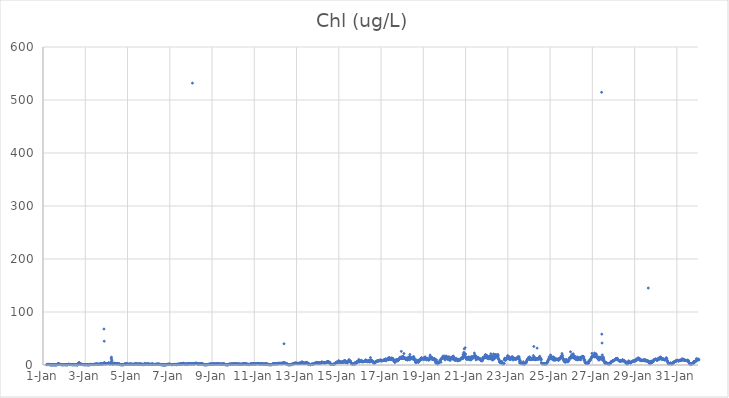
| Category | Chl (ug/L) |
|---|---|
| 44562.166666666664 | 0.7 |
| 44562.177083333336 | 0.87 |
| 44562.1875 | 0.81 |
| 44562.197916666664 | 0.81 |
| 44562.208333333336 | 0.92 |
| 44562.21875 | 0.9 |
| 44562.229166666664 | 1.01 |
| 44562.239583333336 | 1.39 |
| 44562.25 | 1 |
| 44562.260416666664 | 0.93 |
| 44562.270833333336 | 0.94 |
| 44562.28125 | 0.81 |
| 44562.291666666664 | 0.79 |
| 44562.302083333336 | 0.75 |
| 44562.3125 | 0.6 |
| 44562.322916666664 | 0.63 |
| 44562.333333333336 | 0.68 |
| 44562.34375 | 0.9 |
| 44562.354166666664 | 0.45 |
| 44562.364583333336 | 0.42 |
| 44562.375 | 0.45 |
| 44562.385416666664 | 0.47 |
| 44562.395833333336 | 0.44 |
| 44562.40625 | 0.43 |
| 44562.416666666664 | 0.4 |
| 44562.427083333336 | 0.54 |
| 44562.4375 | 0.45 |
| 44562.447916666664 | 0.45 |
| 44562.458333333336 | 0.47 |
| 44562.46875 | 0.33 |
| 44562.479166666664 | 0.47 |
| 44562.489583333336 | 0.49 |
| 44562.5 | 0.47 |
| 44562.510416666664 | 0.61 |
| 44562.520833333336 | 0.6 |
| 44562.53125 | 0.54 |
| 44562.541666666664 | 0.44 |
| 44562.552083333336 | 0.39 |
| 44562.5625 | 0.28 |
| 44562.572916666664 | 0.37 |
| 44562.583333333336 | 0.36 |
| 44562.59375 | 0.3 |
| 44562.604166666664 | 0.45 |
| 44562.614583333336 | 0.37 |
| 44562.625 | 0.44 |
| 44562.635416666664 | 0.46 |
| 44562.645833333336 | 0.42 |
| 44562.65625 | 0.52 |
| 44562.666666666664 | 0.74 |
| 44562.677083333336 | 0.89 |
| 44562.6875 | 1.62 |
| 44562.697916666664 | 1.38 |
| 44562.708333333336 | 2.7 |
| 44562.71875 | 2.04 |
| 44562.729166666664 | 1.4 |
| 44562.739583333336 | 1.65 |
| 44562.75 | 1.95 |
| 44562.760416666664 | 1.29 |
| 44562.770833333336 | 1.16 |
| 44562.78125 | 1.77 |
| 44562.791666666664 | 1.46 |
| 44562.802083333336 | 1.2 |
| 44562.8125 | 0.99 |
| 44562.822916666664 | 0.96 |
| 44562.833333333336 | 0.88 |
| 44562.84375 | 0.95 |
| 44562.854166666664 | 0.77 |
| 44562.864583333336 | 0.7 |
| 44562.875 | 0.73 |
| 44562.885416666664 | 0.69 |
| 44562.895833333336 | 0.67 |
| 44562.90625 | 0.59 |
| 44562.916666666664 | 0.61 |
| 44562.927083333336 | 0.42 |
| 44562.9375 | 0.45 |
| 44562.947916666664 | 0.65 |
| 44562.958333333336 | 0.63 |
| 44562.96875 | 0.7 |
| 44562.979166666664 | 0.64 |
| 44562.989583333336 | 0.6 |
| 44563.0 | 0.71 |
| 44563.010416666664 | 0.66 |
| 44563.020833333336 | 0.74 |
| 44563.03125 | 0.86 |
| 44563.041666666664 | 0.61 |
| 44563.052083333336 | 0.52 |
| 44563.0625 | 0.63 |
| 44563.072916666664 | 0.62 |
| 44563.083333333336 | 0.54 |
| 44563.09375 | 0.6 |
| 44563.104166666664 | 0.51 |
| 44563.114583333336 | 0.6 |
| 44563.125 | 0.47 |
| 44563.135416666664 | 0.46 |
| 44563.145833333336 | 0.51 |
| 44563.15625 | 0.57 |
| 44563.166666666664 | 0.61 |
| 44563.177083333336 | 0.76 |
| 44563.1875 | 0.81 |
| 44563.197916666664 | 0.91 |
| 44563.208333333336 | 1.67 |
| 44563.21875 | 1.21 |
| 44563.229166666664 | 1.25 |
| 44563.239583333336 | 1.08 |
| 44563.25 | 0.99 |
| 44563.260416666664 | 0.96 |
| 44563.270833333336 | 0.87 |
| 44563.28125 | 1.01 |
| 44563.291666666664 | 0.85 |
| 44563.302083333336 | 0.84 |
| 44563.3125 | 0.88 |
| 44563.322916666664 | 0.85 |
| 44563.333333333336 | 0.77 |
| 44563.34375 | 0.86 |
| 44563.354166666664 | 0.83 |
| 44563.364583333336 | 0.62 |
| 44563.375 | 0.76 |
| 44563.385416666664 | 0.64 |
| 44563.395833333336 | 0.69 |
| 44563.40625 | 0.62 |
| 44563.416666666664 | 0.48 |
| 44563.427083333336 | 0.53 |
| 44563.4375 | 0.54 |
| 44563.447916666664 | 0.68 |
| 44563.458333333336 | 0.6 |
| 44563.46875 | 0.61 |
| 44563.479166666664 | 0.6 |
| 44563.489583333336 | 0.54 |
| 44563.5 | 0.68 |
| 44563.510416666664 | 0.56 |
| 44563.520833333336 | 0.67 |
| 44563.53125 | 0.65 |
| 44563.541666666664 | 0.57 |
| 44563.552083333336 | 0.58 |
| 44563.5625 | 0.67 |
| 44563.572916666664 | 0.66 |
| 44563.583333333336 | 0.51 |
| 44563.59375 | 0.51 |
| 44563.604166666664 | 0.51 |
| 44563.614583333336 | 0.65 |
| 44563.625 | 0.37 |
| 44563.635416666664 | 0.31 |
| 44563.645833333336 | 0.37 |
| 44563.65625 | 2.34 |
| 44563.666666666664 | 2.14 |
| 44563.677083333336 | 3.11 |
| 44563.6875 | 2.67 |
| 44563.697916666664 | 3.8 |
| 44563.708333333336 | 3.76 |
| 44563.71875 | 4.67 |
| 44563.729166666664 | 3.15 |
| 44563.739583333336 | 2.54 |
| 44563.75 | 1.52 |
| 44563.760416666664 | 1.08 |
| 44563.770833333336 | 1.08 |
| 44563.78125 | 1.09 |
| 44563.791666666664 | 1.12 |
| 44563.802083333336 | 1.13 |
| 44563.8125 | 1.22 |
| 44563.822916666664 | 1.57 |
| 44563.833333333336 | 1.27 |
| 44563.84375 | 1.12 |
| 44563.854166666664 | 0.95 |
| 44563.864583333336 | 0.85 |
| 44563.875 | 0.91 |
| 44563.885416666664 | 0.79 |
| 44563.895833333336 | 0.82 |
| 44563.90625 | 0.74 |
| 44563.916666666664 | 0.78 |
| 44563.927083333336 | 0.65 |
| 44563.9375 | 0.67 |
| 44563.947916666664 | 0.61 |
| 44563.958333333336 | 0.61 |
| 44563.96875 | 0.56 |
| 44563.979166666664 | 0.51 |
| 44563.989583333336 | 0.45 |
| 44564.0 | 0.46 |
| 44564.010416666664 | 0.62 |
| 44564.020833333336 | 0.64 |
| 44564.03125 | 0.57 |
| 44564.041666666664 | 0.64 |
| 44564.052083333336 | 0.82 |
| 44564.0625 | 0.87 |
| 44564.072916666664 | 0.5 |
| 44564.083333333336 | 0.71 |
| 44564.09375 | 0.53 |
| 44564.104166666664 | 0.55 |
| 44564.114583333336 | 0.56 |
| 44564.125 | 0.5 |
| 44564.135416666664 | 0.48 |
| 44564.145833333336 | 0.45 |
| 44564.15625 | 0.47 |
| 44564.166666666664 | 0.45 |
| 44564.177083333336 | 0.56 |
| 44564.1875 | 0.64 |
| 44564.197916666664 | 0.65 |
| 44564.208333333336 | 0.56 |
| 44564.21875 | 0.6 |
| 44564.229166666664 | 0.71 |
| 44564.239583333336 | 0.85 |
| 44564.25 | 1.19 |
| 44564.260416666664 | 1 |
| 44564.270833333336 | 1.05 |
| 44564.28125 | 1.03 |
| 44564.291666666664 | 1 |
| 44564.302083333336 | 0.96 |
| 44564.3125 | 1.01 |
| 44564.322916666664 | 1.03 |
| 44564.333333333336 | 0.97 |
| 44564.34375 | 0.89 |
| 44564.354166666664 | 1.07 |
| 44564.364583333336 | 0.96 |
| 44564.375 | 0.75 |
| 44564.385416666664 | 0.88 |
| 44564.395833333336 | 0.85 |
| 44564.40625 | 1.03 |
| 44564.416666666664 | 1.12 |
| 44564.427083333336 | 1.32 |
| 44564.4375 | 1.21 |
| 44564.447916666664 | 1.36 |
| 44564.458333333336 | 1.46 |
| 44564.46875 | 1.45 |
| 44564.479166666664 | 1.41 |
| 44564.489583333336 | 1.6 |
| 44564.5 | 1.44 |
| 44564.510416666664 | 1.46 |
| 44564.520833333336 | 1.5 |
| 44564.53125 | 1.79 |
| 44564.541666666664 | 1.87 |
| 44564.552083333336 | 1.82 |
| 44564.5625 | 1.7 |
| 44564.572916666664 | 1.58 |
| 44564.583333333336 | 1.58 |
| 44564.59375 | 1.58 |
| 44564.604166666664 | 1.35 |
| 44564.614583333336 | 1.26 |
| 44564.625 | 1.24 |
| 44564.635416666664 | 1.33 |
| 44564.645833333336 | 1.28 |
| 44564.65625 | 1.35 |
| 44564.666666666664 | 1.25 |
| 44564.677083333336 | 1.23 |
| 44564.6875 | 1.42 |
| 44564.697916666664 | 1.69 |
| 44564.708333333336 | 1.8 |
| 44564.71875 | 2.59 |
| 44564.729166666664 | 2.02 |
| 44564.739583333336 | 2.81 |
| 44564.75 | 1.94 |
| 44564.760416666664 | 1.98 |
| 44564.770833333336 | 2.06 |
| 44564.78125 | 1.95 |
| 44564.791666666664 | 1.95 |
| 44564.802083333336 | 1.74 |
| 44564.8125 | 2.14 |
| 44564.822916666664 | 1.97 |
| 44564.833333333336 | 2.16 |
| 44564.84375 | 2.32 |
| 44564.854166666664 | 2.19 |
| 44564.864583333336 | 2.26 |
| 44564.875 | 2.55 |
| 44564.885416666664 | 67.88 |
| 44564.895833333336 | 44.92 |
| 44564.90625 | 4.78 |
| 44564.916666666664 | 2.61 |
| 44564.927083333336 | 2.14 |
| 44564.9375 | 2.31 |
| 44564.947916666664 | 2.33 |
| 44564.958333333336 | 2.29 |
| 44564.96875 | 2.76 |
| 44564.979166666664 | 2.57 |
| 44564.989583333336 | 2.32 |
| 44565.0 | 2.49 |
| 44565.010416666664 | 2.39 |
| 44565.020833333336 | 2.58 |
| 44565.03125 | 2.44 |
| 44565.041666666664 | 2.48 |
| 44565.052083333336 | 2.57 |
| 44565.0625 | 2.75 |
| 44565.072916666664 | 2.61 |
| 44565.083333333336 | 2.77 |
| 44565.09375 | 3.09 |
| 44565.104166666664 | 3.41 |
| 44565.114583333336 | 4.19 |
| 44565.125 | 3.48 |
| 44565.135416666664 | 2.44 |
| 44565.145833333336 | 2.37 |
| 44565.15625 | 2.21 |
| 44565.166666666664 | 2.52 |
| 44565.177083333336 | 2.38 |
| 44565.1875 | 2.32 |
| 44565.197916666664 | 1.87 |
| 44565.208333333336 | 1.82 |
| 44565.21875 | 5.43 |
| 44565.229166666664 | 12.92 |
| 44565.239583333336 | 14.78 |
| 44565.25 | 10.24 |
| 44565.260416666664 | 7.89 |
| 44565.270833333336 | 2 |
| 44565.28125 | 1.95 |
| 44565.291666666664 | 1.84 |
| 44565.302083333336 | 1.88 |
| 44565.3125 | 2.09 |
| 44565.322916666664 | 2.2 |
| 44565.333333333336 | 2.31 |
| 44565.34375 | 2.15 |
| 44565.354166666664 | 2.36 |
| 44565.364583333336 | 3.84 |
| 44565.375 | 2.36 |
| 44565.385416666664 | 2.51 |
| 44565.395833333336 | 2.37 |
| 44565.40625 | 2.92 |
| 44565.416666666664 | 2.67 |
| 44565.427083333336 | 2.57 |
| 44565.4375 | 2.37 |
| 44565.447916666664 | 2.26 |
| 44565.458333333336 | 2.38 |
| 44565.46875 | 2.12 |
| 44565.479166666664 | 2.09 |
| 44565.489583333336 | 2.1 |
| 44565.5 | 2.07 |
| 44565.510416666664 | 2.2 |
| 44565.520833333336 | 2.23 |
| 44565.53125 | 2.68 |
| 44565.541666666664 | 2.61 |
| 44565.552083333336 | 2.34 |
| 44565.5625 | 2.42 |
| 44565.572916666664 | 2.3 |
| 44565.583333333336 | 2 |
| 44565.59375 | 2.2 |
| 44565.604166666664 | 1.94 |
| 44565.614583333336 | 1.65 |
| 44565.625 | 1.37 |
| 44565.635416666664 | 1.29 |
| 44565.645833333336 | 1.24 |
| 44565.65625 | 0.6 |
| 44565.666666666664 | 0.67 |
| 44565.677083333336 | 0.81 |
| 44565.6875 | 0.8 |
| 44565.697916666664 | 0.89 |
| 44565.708333333336 | 0.62 |
| 44565.71875 | 0.66 |
| 44565.729166666664 | 0.46 |
| 44565.739583333336 | 0.5 |
| 44565.75 | 0.57 |
| 44565.760416666664 | 0.45 |
| 44565.770833333336 | 0.6 |
| 44565.78125 | 0.59 |
| 44565.791666666664 | 0.4 |
| 44565.802083333336 | 0.48 |
| 44565.8125 | 0.71 |
| 44565.822916666664 | 0.74 |
| 44565.833333333336 | 1.09 |
| 44565.84375 | 1.46 |
| 44565.854166666664 | 1.68 |
| 44565.864583333336 | 1.65 |
| 44565.875 | 1.93 |
| 44565.885416666664 | 2.02 |
| 44565.895833333336 | 1.85 |
| 44565.90625 | 1.96 |
| 44565.916666666664 | 1.81 |
| 44565.927083333336 | 1.98 |
| 44565.9375 | 2.05 |
| 44565.947916666664 | 2.19 |
| 44565.958333333336 | 1.89 |
| 44565.96875 | 1.82 |
| 44565.979166666664 | 1.84 |
| 44565.989583333336 | 1.74 |
| 44566.0 | 1.63 |
| 44566.010416666664 | 1.41 |
| 44566.020833333336 | 1.33 |
| 44566.03125 | 1.39 |
| 44566.041666666664 | 1.29 |
| 44566.052083333336 | 1.25 |
| 44566.0625 | 1.44 |
| 44566.072916666664 | 1.3 |
| 44566.083333333336 | 1.41 |
| 44566.09375 | 1.43 |
| 44566.104166666664 | 1.6 |
| 44566.114583333336 | 1.61 |
| 44566.125 | 1.65 |
| 44566.135416666664 | 1.71 |
| 44566.145833333336 | 1.81 |
| 44566.15625 | 1.94 |
| 44566.166666666664 | 1.53 |
| 44566.177083333336 | 1.4 |
| 44566.1875 | 1.24 |
| 44566.197916666664 | 1.23 |
| 44566.208333333336 | 1.26 |
| 44566.21875 | 1.54 |
| 44566.229166666664 | 1.29 |
| 44566.239583333336 | 1.16 |
| 44566.25 | 1.19 |
| 44566.260416666664 | 1.08 |
| 44566.270833333336 | 1.09 |
| 44566.28125 | 1.17 |
| 44566.291666666664 | 1.29 |
| 44566.302083333336 | 1.52 |
| 44566.3125 | 1.56 |
| 44566.322916666664 | 1.42 |
| 44566.333333333336 | 1.71 |
| 44566.34375 | 1.63 |
| 44566.354166666664 | 1.65 |
| 44566.364583333336 | 1.7 |
| 44566.375 | 1.82 |
| 44566.385416666664 | 2.26 |
| 44566.395833333336 | 1.82 |
| 44566.40625 | 2.06 |
| 44566.416666666664 | 2.18 |
| 44566.427083333336 | 1.7 |
| 44566.4375 | 1.73 |
| 44566.447916666664 | 1.67 |
| 44566.458333333336 | 1.82 |
| 44566.46875 | 1.76 |
| 44566.479166666664 | 1.67 |
| 44566.489583333336 | 1.53 |
| 44566.5 | 1.37 |
| 44566.510416666664 | 1.51 |
| 44566.520833333336 | 1.33 |
| 44566.53125 | 1.53 |
| 44566.541666666664 | 1.46 |
| 44566.552083333336 | 1.68 |
| 44566.5625 | 1.81 |
| 44566.572916666664 | 1.67 |
| 44566.583333333336 | 1.67 |
| 44566.59375 | 1.96 |
| 44566.604166666664 | 1.98 |
| 44566.614583333336 | 1.85 |
| 44566.625 | 1.54 |
| 44566.635416666664 | 1.36 |
| 44566.645833333336 | 1.24 |
| 44566.65625 | 1.19 |
| 44566.666666666664 | 1.57 |
| 44566.677083333336 | 1.67 |
| 44566.6875 | 1.59 |
| 44566.697916666664 | 1.4 |
| 44566.708333333336 | 1.12 |
| 44566.71875 | 0.51 |
| 44566.729166666664 | 1.27 |
| 44566.739583333336 | 1.25 |
| 44566.75 | 0.97 |
| 44566.760416666664 | 0.98 |
| 44566.770833333336 | 0.54 |
| 44566.78125 | 0.96 |
| 44566.791666666664 | 0.89 |
| 44566.802083333336 | 0.95 |
| 44566.8125 | 3.14 |
| 44566.822916666664 | 1.35 |
| 44566.833333333336 | 1.18 |
| 44566.84375 | 1.45 |
| 44566.854166666664 | 1.49 |
| 44566.864583333336 | 1.72 |
| 44566.875 | 1.47 |
| 44566.885416666664 | 1.75 |
| 44566.895833333336 | 1.55 |
| 44566.90625 | 1.58 |
| 44566.916666666664 | 1.42 |
| 44566.927083333336 | 2.04 |
| 44566.9375 | 1.87 |
| 44566.947916666664 | 1.87 |
| 44566.958333333336 | 1.76 |
| 44566.96875 | 1.95 |
| 44566.979166666664 | 1.55 |
| 44566.989583333336 | 1.67 |
| 44567.0 | 1.76 |
| 44567.010416666664 | 1.47 |
| 44567.020833333336 | 1.48 |
| 44567.03125 | 1.64 |
| 44567.041666666664 | 1.36 |
| 44567.052083333336 | 1.21 |
| 44567.0625 | 1.12 |
| 44567.072916666664 | 1.11 |
| 44567.083333333336 | 1.17 |
| 44567.09375 | 1.11 |
| 44567.104166666664 | 1.19 |
| 44567.114583333336 | 1.37 |
| 44567.125 | 1.33 |
| 44567.135416666664 | 1.18 |
| 44567.145833333336 | 1.37 |
| 44567.15625 | 1.41 |
| 44567.166666666664 | 2.55 |
| 44567.177083333336 | 1.71 |
| 44567.1875 | 1.58 |
| 44567.197916666664 | 1.69 |
| 44567.208333333336 | 1.19 |
| 44567.21875 | 1.13 |
| 44567.229166666664 | 1.01 |
| 44567.239583333336 | 1.12 |
| 44567.25 | 1.15 |
| 44567.260416666664 | 1.06 |
| 44567.270833333336 | 1.05 |
| 44567.28125 | 1.04 |
| 44567.291666666664 | 1.05 |
| 44567.302083333336 | 1.07 |
| 44567.3125 | 0.99 |
| 44567.322916666664 | 1.04 |
| 44567.333333333336 | 1.11 |
| 44567.34375 | 1.36 |
| 44567.354166666664 | 1.47 |
| 44567.364583333336 | 1.21 |
| 44567.375 | 1.46 |
| 44567.385416666664 | 1.34 |
| 44567.395833333336 | 1.43 |
| 44567.40625 | 1.48 |
| 44567.416666666664 | 1.47 |
| 44567.427083333336 | 1.66 |
| 44567.4375 | 1.62 |
| 44567.447916666664 | 1.49 |
| 44567.458333333336 | 1.62 |
| 44567.46875 | 1.49 |
| 44567.479166666664 | 1.43 |
| 44567.489583333336 | 1.38 |
| 44567.5 | 1.5 |
| 44567.510416666664 | 1.4 |
| 44567.520833333336 | 1.2 |
| 44567.53125 | 1.26 |
| 44567.541666666664 | 1.19 |
| 44567.552083333336 | 0.89 |
| 44567.5625 | 0.72 |
| 44567.572916666664 | 0.81 |
| 44567.583333333336 | 0.75 |
| 44567.59375 | 0.83 |
| 44567.604166666664 | 0.7 |
| 44567.614583333336 | 0.6 |
| 44567.625 | 0.84 |
| 44567.635416666664 | 1.01 |
| 44567.645833333336 | 0.83 |
| 44567.65625 | 0.29 |
| 44567.666666666664 | 0.24 |
| 44567.677083333336 | 0.31 |
| 44567.6875 | 0.23 |
| 44567.697916666664 | 0.4 |
| 44567.708333333336 | 0.32 |
| 44567.71875 | 0.23 |
| 44567.729166666664 | 0.34 |
| 44567.739583333336 | 0.33 |
| 44567.75 | 0.35 |
| 44567.760416666664 | 0.37 |
| 44567.770833333336 | 0.55 |
| 44567.78125 | 0.4 |
| 44567.791666666664 | 0.48 |
| 44567.802083333336 | 0.35 |
| 44567.8125 | 0.28 |
| 44567.822916666664 | 0.57 |
| 44567.833333333336 | 0.47 |
| 44567.84375 | 0.66 |
| 44567.854166666664 | 0.66 |
| 44567.864583333336 | 0.93 |
| 44567.875 | 1.16 |
| 44567.885416666664 | 1.22 |
| 44567.895833333336 | 1.09 |
| 44567.90625 | 1.2 |
| 44567.916666666664 | 1.16 |
| 44567.927083333336 | 1.15 |
| 44567.9375 | 1.3 |
| 44567.947916666664 | 1.54 |
| 44567.958333333336 | 1.38 |
| 44567.96875 | 1.48 |
| 44567.979166666664 | 1.43 |
| 44567.989583333336 | 1.34 |
| 44568.0 | 1.26 |
| 44568.010416666664 | 1.28 |
| 44568.020833333336 | 1.26 |
| 44568.03125 | 1.16 |
| 44568.041666666664 | 1 |
| 44568.052083333336 | 0.94 |
| 44568.0625 | 0.88 |
| 44568.072916666664 | 0.93 |
| 44568.083333333336 | 0.74 |
| 44568.09375 | 0.69 |
| 44568.104166666664 | 0.65 |
| 44568.114583333336 | 0.59 |
| 44568.125 | 0.71 |
| 44568.135416666664 | 0.8 |
| 44568.145833333336 | 0.84 |
| 44568.15625 | 0.92 |
| 44568.166666666664 | 0.93 |
| 44568.177083333336 | 0.96 |
| 44568.1875 | 1.03 |
| 44568.197916666664 | 1.02 |
| 44568.208333333336 | 1.1 |
| 44568.21875 | 0.97 |
| 44568.229166666664 | 1.02 |
| 44568.239583333336 | 1.05 |
| 44568.25 | 1.09 |
| 44568.260416666664 | 1.06 |
| 44568.270833333336 | 0.87 |
| 44568.28125 | 0.89 |
| 44568.291666666664 | 0.78 |
| 44568.302083333336 | 0.74 |
| 44568.3125 | 0.71 |
| 44568.322916666664 | 0.68 |
| 44568.333333333336 | 0.66 |
| 44568.34375 | 1.51 |
| 44568.354166666664 | 0.99 |
| 44568.364583333336 | 1.38 |
| 44568.375 | 1.46 |
| 44568.385416666664 | 0.91 |
| 44568.395833333336 | 1.06 |
| 44568.40625 | 1.2 |
| 44568.416666666664 | 1.32 |
| 44568.427083333336 | 1.38 |
| 44568.4375 | 1.57 |
| 44568.447916666664 | 1.49 |
| 44568.458333333336 | 1.58 |
| 44568.46875 | 1.53 |
| 44568.479166666664 | 1.75 |
| 44568.489583333336 | 1.93 |
| 44568.5 | 1.98 |
| 44568.510416666664 | 2.24 |
| 44568.520833333336 | 1.78 |
| 44568.53125 | 1.48 |
| 44568.541666666664 | 1.77 |
| 44568.552083333336 | 1.67 |
| 44568.5625 | 1.61 |
| 44568.572916666664 | 2.57 |
| 44568.583333333336 | 2.75 |
| 44568.59375 | 2.03 |
| 44568.604166666664 | 1.78 |
| 44568.614583333336 | 2.15 |
| 44568.625 | 2.11 |
| 44568.635416666664 | 2.93 |
| 44568.645833333336 | 2.41 |
| 44568.65625 | 3.17 |
| 44568.666666666664 | 3.24 |
| 44568.677083333336 | 2.98 |
| 44568.6875 | 2.19 |
| 44568.697916666664 | 1.45 |
| 44568.708333333336 | 2.04 |
| 44568.71875 | 1.53 |
| 44568.729166666664 | 1.34 |
| 44568.739583333336 | 1.57 |
| 44568.75 | 1.04 |
| 44568.760416666664 | 1.21 |
| 44568.770833333336 | 1.24 |
| 44568.78125 | 1.28 |
| 44568.791666666664 | 1.36 |
| 44568.802083333336 | 3 |
| 44568.8125 | 1.03 |
| 44568.822916666664 | 1.32 |
| 44568.833333333336 | 1.32 |
| 44568.84375 | 1.6 |
| 44568.854166666664 | 2.14 |
| 44568.864583333336 | 1.86 |
| 44568.875 | 1.9 |
| 44568.885416666664 | 2.22 |
| 44568.895833333336 | 2.14 |
| 44568.90625 | 2.1 |
| 44568.916666666664 | 2.33 |
| 44568.927083333336 | 2.04 |
| 44568.9375 | 1.97 |
| 44568.947916666664 | 2.1 |
| 44568.958333333336 | 2.12 |
| 44568.96875 | 2.88 |
| 44568.979166666664 | 2.75 |
| 44568.989583333336 | 2.26 |
| 44569.0 | 1.95 |
| 44569.010416666664 | 1.83 |
| 44569.020833333336 | 1.94 |
| 44569.03125 | 2.37 |
| 44569.041666666664 | 2.12 |
| 44569.052083333336 | 2.15 |
| 44569.0625 | 2.13 |
| 44569.072916666664 | 531.84 |
| 44569.083333333336 | 2.23 |
| 44569.09375 | 2.44 |
| 44569.104166666664 | 2.72 |
| 44569.114583333336 | 2.42 |
| 44569.125 | 1.99 |
| 44569.135416666664 | 2.08 |
| 44569.145833333336 | 1.87 |
| 44569.15625 | 2 |
| 44569.166666666664 | 1.93 |
| 44569.177083333336 | 2.23 |
| 44569.1875 | 2.62 |
| 44569.197916666664 | 2.58 |
| 44569.208333333336 | 2.69 |
| 44569.21875 | 2.76 |
| 44569.229166666664 | 3.39 |
| 44569.239583333336 | 3.42 |
| 44569.25 | 3.54 |
| 44569.260416666664 | 2.96 |
| 44569.270833333336 | 2.95 |
| 44569.28125 | 2.56 |
| 44569.291666666664 | 2.57 |
| 44569.302083333336 | 2.18 |
| 44569.3125 | 2.23 |
| 44569.322916666664 | 2.32 |
| 44569.333333333336 | 1.91 |
| 44569.34375 | 1.81 |
| 44569.354166666664 | 1.83 |
| 44569.364583333336 | 1.71 |
| 44569.375 | 1.65 |
| 44569.385416666664 | 1.77 |
| 44569.395833333336 | 1.88 |
| 44569.40625 | 2.02 |
| 44569.416666666664 | 2.09 |
| 44569.427083333336 | 2 |
| 44569.4375 | 1.85 |
| 44569.447916666664 | 1.95 |
| 44569.458333333336 | 2 |
| 44569.46875 | 1.9 |
| 44569.479166666664 | 1.93 |
| 44569.489583333336 | 2.2 |
| 44569.5 | 2.65 |
| 44569.510416666664 | 2.3 |
| 44569.520833333336 | 2.34 |
| 44569.53125 | 2.19 |
| 44569.541666666664 | 2.1 |
| 44569.552083333336 | 2.07 |
| 44569.5625 | 1.8 |
| 44569.572916666664 | 1.41 |
| 44569.583333333336 | 1.14 |
| 44569.59375 | 1.31 |
| 44569.604166666664 | 1.06 |
| 44569.614583333336 | 0.81 |
| 44569.625 | 0.66 |
| 44569.635416666664 | 0.6 |
| 44569.645833333336 | 0.51 |
| 44569.65625 | 0.58 |
| 44569.666666666664 | 0.33 |
| 44569.677083333336 | 0.6 |
| 44569.6875 | 0.55 |
| 44569.697916666664 | 0.42 |
| 44569.708333333336 | 0.44 |
| 44569.71875 | 0.64 |
| 44569.729166666664 | 0.5 |
| 44569.739583333336 | 0.61 |
| 44569.75 | 0.73 |
| 44569.760416666664 | 0.69 |
| 44569.770833333336 | 1.13 |
| 44569.78125 | 0.94 |
| 44569.791666666664 | 0.54 |
| 44569.802083333336 | 0.58 |
| 44569.8125 | 1.15 |
| 44569.822916666664 | 1.09 |
| 44569.833333333336 | 1.2 |
| 44569.84375 | 1.04 |
| 44569.854166666664 | 0.75 |
| 44569.864583333336 | 0.81 |
| 44569.875 | 1.38 |
| 44569.885416666664 | 1.54 |
| 44569.895833333336 | 1.74 |
| 44569.90625 | 1.64 |
| 44569.916666666664 | 1.61 |
| 44569.927083333336 | 1.63 |
| 44569.9375 | 1.62 |
| 44569.947916666664 | 1.66 |
| 44569.958333333336 | 1.6 |
| 44569.96875 | 1.64 |
| 44569.979166666664 | 1.6 |
| 44569.989583333336 | 1.75 |
| 44570.0 | 1.68 |
| 44570.010416666664 | 1.63 |
| 44570.020833333336 | 1.79 |
| 44570.03125 | 2.53 |
| 44570.041666666664 | 1.79 |
| 44570.052083333336 | 1.92 |
| 44570.0625 | 1.75 |
| 44570.072916666664 | 1.85 |
| 44570.083333333336 | 1.83 |
| 44570.09375 | 1.95 |
| 44570.104166666664 | 1.83 |
| 44570.114583333336 | 1.91 |
| 44570.125 | 2.01 |
| 44570.135416666664 | 1.85 |
| 44570.145833333336 | 1.88 |
| 44570.15625 | 1.74 |
| 44570.166666666664 | 1.63 |
| 44570.177083333336 | 1.84 |
| 44570.1875 | 1.68 |
| 44570.197916666664 | 1.67 |
| 44570.208333333336 | 1.69 |
| 44570.21875 | 1.91 |
| 44570.229166666664 | 2.15 |
| 44570.239583333336 | 2.1 |
| 44570.25 | 2.47 |
| 44570.260416666664 | 2.39 |
| 44570.270833333336 | 2.35 |
| 44570.28125 | 2.07 |
| 44570.291666666664 | 2.23 |
| 44570.302083333336 | 2.25 |
| 44570.3125 | 1.9 |
| 44570.322916666664 | 1.77 |
| 44570.333333333336 | 1.71 |
| 44570.34375 | 1.74 |
| 44570.354166666664 | 1.77 |
| 44570.364583333336 | 1.65 |
| 44570.375 | 1.48 |
| 44570.385416666664 | 1.64 |
| 44570.395833333336 | 1.62 |
| 44570.40625 | 1.55 |
| 44570.416666666664 | 1.62 |
| 44570.427083333336 | 1.54 |
| 44570.4375 | 1.54 |
| 44570.447916666664 | 1.54 |
| 44570.458333333336 | 1.47 |
| 44570.46875 | 1.47 |
| 44570.479166666664 | 1.62 |
| 44570.489583333336 | 1.49 |
| 44570.5 | 1.59 |
| 44570.510416666664 | 1.7 |
| 44570.520833333336 | 2.17 |
| 44570.53125 | 2.02 |
| 44570.541666666664 | 1.85 |
| 44570.552083333336 | 1.92 |
| 44570.5625 | 1.83 |
| 44570.572916666664 | 2.24 |
| 44570.583333333336 | 1.57 |
| 44570.59375 | 1.07 |
| 44570.604166666664 | 0.95 |
| 44570.614583333336 | 0.64 |
| 44570.625 | 0.64 |
| 44570.635416666664 | 0.68 |
| 44570.645833333336 | 0.67 |
| 44570.65625 | 0.42 |
| 44570.666666666664 | 0.57 |
| 44570.677083333336 | 0.62 |
| 44570.6875 | 0.78 |
| 44570.697916666664 | 0.49 |
| 44570.708333333336 | 0.51 |
| 44570.71875 | 0.4 |
| 44570.729166666664 | 0.38 |
| 44570.739583333336 | 0.55 |
| 44570.75 | 0.42 |
| 44570.760416666664 | 0.46 |
| 44570.770833333336 | 0.4 |
| 44570.78125 | 1.02 |
| 44570.791666666664 | 1.25 |
| 44570.802083333336 | 1.46 |
| 44570.8125 | 1.32 |
| 44570.822916666664 | 1.44 |
| 44570.833333333336 | 1.34 |
| 44570.84375 | 1.44 |
| 44570.854166666664 | 1.45 |
| 44570.864583333336 | 1.66 |
| 44570.875 | 1.54 |
| 44570.885416666664 | 1.53 |
| 44570.895833333336 | 1.56 |
| 44570.90625 | 1.6 |
| 44570.916666666664 | 1.68 |
| 44570.927083333336 | 1.75 |
| 44570.9375 | 1.82 |
| 44570.947916666664 | 1.77 |
| 44570.958333333336 | 1.77 |
| 44570.96875 | 1.77 |
| 44570.979166666664 | 1.69 |
| 44570.989583333336 | 1.68 |
| 44571.0 | 1.8 |
| 44571.010416666664 | 1.83 |
| 44571.020833333336 | 1.76 |
| 44571.03125 | 1.92 |
| 44571.041666666664 | 2.09 |
| 44571.052083333336 | 1.88 |
| 44571.0625 | 1.95 |
| 44571.072916666664 | 1.9 |
| 44571.083333333336 | 2.11 |
| 44571.09375 | 1.96 |
| 44571.104166666664 | 2.06 |
| 44571.114583333336 | 2.16 |
| 44571.125 | 2.25 |
| 44571.135416666664 | 1.94 |
| 44571.145833333336 | 2.02 |
| 44571.15625 | 2.19 |
| 44571.166666666664 | 2.04 |
| 44571.177083333336 | 2.11 |
| 44571.1875 | 1.89 |
| 44571.197916666664 | 1.82 |
| 44571.208333333336 | 1.61 |
| 44571.21875 | 1.49 |
| 44571.229166666664 | 1.5 |
| 44571.239583333336 | 1.29 |
| 44571.25 | 1.86 |
| 44571.260416666664 | 1.37 |
| 44571.270833333336 | 1.57 |
| 44571.28125 | 1.68 |
| 44571.291666666664 | 1.58 |
| 44571.302083333336 | 1.93 |
| 44571.3125 | 1.56 |
| 44571.322916666664 | 1.47 |
| 44571.333333333336 | 1.32 |
| 44571.34375 | 1.33 |
| 44571.354166666664 | 1.37 |
| 44571.364583333336 | 1.33 |
| 44571.375 | 1.51 |
| 44571.385416666664 | 1.17 |
| 44571.395833333336 | 1.36 |
| 44571.40625 | 1.4 |
| 44571.416666666664 | 1.64 |
| 44571.427083333336 | 1.65 |
| 44571.4375 | 1.71 |
| 44571.447916666664 | 1.72 |
| 44571.458333333336 | 1.8 |
| 44571.46875 | 1.96 |
| 44571.479166666664 | 2 |
| 44571.489583333336 | 2.02 |
| 44571.5 | 2 |
| 44571.510416666664 | 2.36 |
| 44571.520833333336 | 2.36 |
| 44571.53125 | 2.26 |
| 44571.541666666664 | 2.24 |
| 44571.552083333336 | 2.36 |
| 44571.5625 | 2.16 |
| 44571.572916666664 | 2.1 |
| 44571.583333333336 | 1.96 |
| 44571.59375 | 2.25 |
| 44571.604166666664 | 2.11 |
| 44571.614583333336 | 2.15 |
| 44571.625 | 2.35 |
| 44571.635416666664 | 1.17 |
| 44571.645833333336 | 1.16 |
| 44571.65625 | 1.09 |
| 44571.666666666664 | 1.42 |
| 44571.677083333336 | 1.34 |
| 44571.6875 | 1.15 |
| 44571.697916666664 | 1.35 |
| 44571.708333333336 | 1.33 |
| 44571.71875 | 1.41 |
| 44571.729166666664 | 0.89 |
| 44571.739583333336 | 0.87 |
| 44571.75 | 0.74 |
| 44571.760416666664 | 0.91 |
| 44571.770833333336 | 1.02 |
| 44571.78125 | 0.73 |
| 44571.791666666664 | 0.99 |
| 44571.802083333336 | 1.44 |
| 44571.8125 | 1.68 |
| 44571.822916666664 | 1.9 |
| 44571.833333333336 | 2.09 |
| 44571.84375 | 2.24 |
| 44571.854166666664 | 2.22 |
| 44571.864583333336 | 2.04 |
| 44571.875 | 2.04 |
| 44571.885416666664 | 1.81 |
| 44571.895833333336 | 1.84 |
| 44571.90625 | 1.71 |
| 44571.916666666664 | 1.84 |
| 44571.927083333336 | 1.81 |
| 44571.9375 | 1.94 |
| 44571.947916666664 | 1.9 |
| 44571.958333333336 | 2.09 |
| 44571.96875 | 2.11 |
| 44571.979166666664 | 2.09 |
| 44571.989583333336 | 2.07 |
| 44572.0 | 2.05 |
| 44572.010416666664 | 2.05 |
| 44572.020833333336 | 1.96 |
| 44572.03125 | 1.97 |
| 44572.041666666664 | 1.99 |
| 44572.052083333336 | 1.93 |
| 44572.0625 | 2.06 |
| 44572.072916666664 | 2.04 |
| 44572.083333333336 | 2.34 |
| 44572.09375 | 2.99 |
| 44572.104166666664 | 2.29 |
| 44572.114583333336 | 2.33 |
| 44572.125 | 2.37 |
| 44572.135416666664 | 2.5 |
| 44572.145833333336 | 2.44 |
| 44572.15625 | 2.65 |
| 44572.166666666664 | 2.48 |
| 44572.177083333336 | 2.5 |
| 44572.1875 | 2.44 |
| 44572.197916666664 | 2.2 |
| 44572.208333333336 | 2.27 |
| 44572.21875 | 2.61 |
| 44572.229166666664 | 2.43 |
| 44572.239583333336 | 1.99 |
| 44572.25 | 1.77 |
| 44572.260416666664 | 1.78 |
| 44572.270833333336 | 1.9 |
| 44572.28125 | 1.77 |
| 44572.291666666664 | 1.98 |
| 44572.302083333336 | 2.08 |
| 44572.3125 | 1.81 |
| 44572.322916666664 | 1.99 |
| 44572.333333333336 | 2.07 |
| 44572.34375 | 2.42 |
| 44572.354166666664 | 1.99 |
| 44572.364583333336 | 2.06 |
| 44572.375 | 2.12 |
| 44572.385416666664 | 2.09 |
| 44572.395833333336 | 1.99 |
| 44572.40625 | 1.97 |
| 44572.416666666664 | 1.71 |
| 44572.427083333336 | 1.93 |
| 44572.4375 | 1.52 |
| 44572.447916666664 | 1.46 |
| 44572.458333333336 | 1.71 |
| 44572.46875 | 1.57 |
| 44572.479166666664 | 1.52 |
| 44572.489583333336 | 1.54 |
| 44572.5 | 1.71 |
| 44572.510416666664 | 1.91 |
| 44572.520833333336 | 2.03 |
| 44572.53125 | 2.29 |
| 44572.541666666664 | 2.25 |
| 44572.552083333336 | 1.97 |
| 44572.5625 | 2.01 |
| 44572.572916666664 | 2.21 |
| 44572.583333333336 | 2.31 |
| 44572.59375 | 1.95 |
| 44572.604166666664 | 2.3 |
| 44572.614583333336 | 1.17 |
| 44572.625 | 0.74 |
| 44572.635416666664 | 0.88 |
| 44572.645833333336 | 0.94 |
| 44572.65625 | 0.74 |
| 44572.666666666664 | 1.17 |
| 44572.677083333336 | 1.02 |
| 44572.6875 | 0.79 |
| 44572.697916666664 | 1.4 |
| 44572.708333333336 | 0.66 |
| 44572.71875 | 0.53 |
| 44572.729166666664 | 0.58 |
| 44572.739583333336 | 0.57 |
| 44572.75 | 0.89 |
| 44572.760416666664 | 0.67 |
| 44572.770833333336 | 0.61 |
| 44572.78125 | 0.69 |
| 44572.791666666664 | 0.6 |
| 44572.802083333336 | 0.62 |
| 44572.8125 | 0.65 |
| 44572.822916666664 | 0.79 |
| 44572.833333333336 | 1.06 |
| 44572.84375 | 1.5 |
| 44572.854166666664 | 1.61 |
| 44572.864583333336 | 1.62 |
| 44572.875 | 1.99 |
| 44572.885416666664 | 2.09 |
| 44572.895833333336 | 2.22 |
| 44572.90625 | 2.01 |
| 44572.916666666664 | 2.72 |
| 44572.927083333336 | 2.29 |
| 44572.9375 | 2.4 |
| 44572.947916666664 | 1.88 |
| 44572.958333333336 | 2 |
| 44572.96875 | 2.02 |
| 44572.979166666664 | 2.33 |
| 44572.989583333336 | 2.16 |
| 44573.0 | 2.2 |
| 44573.010416666664 | 2.38 |
| 44573.020833333336 | 2.41 |
| 44573.03125 | 2.42 |
| 44573.041666666664 | 2.32 |
| 44573.052083333336 | 2.28 |
| 44573.0625 | 2.36 |
| 44573.072916666664 | 2.27 |
| 44573.083333333336 | 2.21 |
| 44573.09375 | 2.21 |
| 44573.104166666664 | 2.38 |
| 44573.114583333336 | 2.51 |
| 44573.125 | 3.63 |
| 44573.135416666664 | 2.45 |
| 44573.145833333336 | 2.6 |
| 44573.15625 | 2.56 |
| 44573.166666666664 | 2.85 |
| 44573.177083333336 | 3.43 |
| 44573.1875 | 2.96 |
| 44573.197916666664 | 2.8 |
| 44573.208333333336 | 2.84 |
| 44573.21875 | 2.95 |
| 44573.229166666664 | 2.95 |
| 44573.239583333336 | 3.32 |
| 44573.25 | 2.6 |
| 44573.260416666664 | 2.63 |
| 44573.270833333336 | 2.61 |
| 44573.28125 | 2.35 |
| 44573.291666666664 | 2.31 |
| 44573.302083333336 | 2.43 |
| 44573.3125 | 3.52 |
| 44573.322916666664 | 4.02 |
| 44573.333333333336 | 2.97 |
| 44573.34375 | 2.97 |
| 44573.354166666664 | 2.98 |
| 44573.364583333336 | 3.34 |
| 44573.375 | 4.37 |
| 44573.385416666664 | 3.38 |
| 44573.395833333336 | 3.61 |
| 44573.40625 | 40.02 |
| 44573.416666666664 | 4.47 |
| 44573.427083333336 | 3.65 |
| 44573.4375 | 4.03 |
| 44573.447916666664 | 3.18 |
| 44573.458333333336 | 2.81 |
| 44573.46875 | 2.77 |
| 44573.479166666664 | 3.2 |
| 44573.489583333336 | 3.18 |
| 44573.5 | 3.3 |
| 44573.510416666664 | 3.21 |
| 44573.520833333336 | 2.8 |
| 44573.53125 | 2.7 |
| 44573.541666666664 | 2.03 |
| 44573.552083333336 | 1.54 |
| 44573.5625 | 0.92 |
| 44573.572916666664 | 0.91 |
| 44573.583333333336 | 0.77 |
| 44573.59375 | 0.68 |
| 44573.604166666664 | 0.64 |
| 44573.614583333336 | 0.57 |
| 44573.625 | 0.53 |
| 44573.635416666664 | 0.6 |
| 44573.645833333336 | 0.63 |
| 44573.65625 | 0.57 |
| 44573.666666666664 | 0.45 |
| 44573.677083333336 | 0.58 |
| 44573.6875 | 0.54 |
| 44573.697916666664 | 0.61 |
| 44573.708333333336 | 0.64 |
| 44573.71875 | 0.75 |
| 44573.729166666664 | 0.76 |
| 44573.739583333336 | 0.73 |
| 44573.75 | 0.59 |
| 44573.760416666664 | 0.91 |
| 44573.770833333336 | 1.48 |
| 44573.78125 | 1.11 |
| 44573.791666666664 | 1.1 |
| 44573.802083333336 | 1.52 |
| 44573.8125 | 1.25 |
| 44573.822916666664 | 1.55 |
| 44573.833333333336 | 1.63 |
| 44573.84375 | 2.19 |
| 44573.854166666664 | 2.47 |
| 44573.864583333336 | 2.82 |
| 44573.875 | 2.87 |
| 44573.885416666664 | 3.18 |
| 44573.895833333336 | 2.86 |
| 44573.90625 | 2.82 |
| 44573.916666666664 | 3.28 |
| 44573.927083333336 | 3.98 |
| 44573.9375 | 3.34 |
| 44573.947916666664 | 3.41 |
| 44573.958333333336 | 3.1 |
| 44573.96875 | 3.09 |
| 44573.979166666664 | 2.96 |
| 44573.989583333336 | 3 |
| 44574.0 | 3.32 |
| 44574.010416666664 | 3.34 |
| 44574.020833333336 | 3.1 |
| 44574.03125 | 3.06 |
| 44574.041666666664 | 3.27 |
| 44574.052083333336 | 2.87 |
| 44574.0625 | 2.88 |
| 44574.072916666664 | 2.88 |
| 44574.083333333336 | 2.92 |
| 44574.09375 | 2.76 |
| 44574.104166666664 | 3 |
| 44574.114583333336 | 2.79 |
| 44574.125 | 2.88 |
| 44574.135416666664 | 3.08 |
| 44574.145833333336 | 3.74 |
| 44574.15625 | 3.62 |
| 44574.166666666664 | 3.77 |
| 44574.177083333336 | 3.32 |
| 44574.1875 | 3.3 |
| 44574.197916666664 | 3.58 |
| 44574.208333333336 | 3.45 |
| 44574.21875 | 3.43 |
| 44574.229166666664 | 3.6 |
| 44574.239583333336 | 3.54 |
| 44574.25 | 4.54 |
| 44574.260416666664 | 6.23 |
| 44574.270833333336 | 3.87 |
| 44574.28125 | 3.82 |
| 44574.291666666664 | 4.31 |
| 44574.302083333336 | 4.35 |
| 44574.3125 | 3.5 |
| 44574.322916666664 | 3.3 |
| 44574.333333333336 | 3.35 |
| 44574.34375 | 3.44 |
| 44574.354166666664 | 3.38 |
| 44574.364583333336 | 3.36 |
| 44574.375 | 3.2 |
| 44574.385416666664 | 3.22 |
| 44574.395833333336 | 3.39 |
| 44574.40625 | 3.91 |
| 44574.416666666664 | 3.71 |
| 44574.427083333336 | 3.87 |
| 44574.4375 | 3.88 |
| 44574.447916666664 | 5.31 |
| 44574.458333333336 | 3.78 |
| 44574.46875 | 4.52 |
| 44574.479166666664 | 3.76 |
| 44574.489583333336 | 3.84 |
| 44574.5 | 3.73 |
| 44574.510416666664 | 3.76 |
| 44574.520833333336 | 3.5 |
| 44574.53125 | 3.35 |
| 44574.541666666664 | 3.86 |
| 44574.552083333336 | 1.34 |
| 44574.5625 | 1.09 |
| 44574.572916666664 | 0.93 |
| 44574.583333333336 | 1.2 |
| 44574.59375 | 1.65 |
| 44574.604166666664 | 1.34 |
| 44574.614583333336 | 1.43 |
| 44574.625 | 0.68 |
| 44574.635416666664 | 0.94 |
| 44574.645833333336 | 0.53 |
| 44574.65625 | 0.56 |
| 44574.666666666664 | 0.98 |
| 44574.677083333336 | 0.64 |
| 44574.6875 | 0.91 |
| 44574.697916666664 | 1.58 |
| 44574.708333333336 | 1.21 |
| 44574.71875 | 1.12 |
| 44574.729166666664 | 1.56 |
| 44574.739583333336 | 1.84 |
| 44574.75 | 1.3 |
| 44574.760416666664 | 1.68 |
| 44574.770833333336 | 1.32 |
| 44574.78125 | 1.34 |
| 44574.791666666664 | 1.59 |
| 44574.802083333336 | 2.64 |
| 44574.8125 | 1.91 |
| 44574.822916666664 | 2.5 |
| 44574.833333333336 | 2.73 |
| 44574.84375 | 2.6 |
| 44574.854166666664 | 2.83 |
| 44574.864583333336 | 3.29 |
| 44574.875 | 3.45 |
| 44574.885416666664 | 3.39 |
| 44574.895833333336 | 3.55 |
| 44574.90625 | 3.53 |
| 44574.916666666664 | 3.48 |
| 44574.927083333336 | 3.47 |
| 44574.9375 | 4.02 |
| 44574.947916666664 | 4.43 |
| 44574.958333333336 | 5.06 |
| 44574.96875 | 4.57 |
| 44574.979166666664 | 4.19 |
| 44574.989583333336 | 3.94 |
| 44575.0 | 4.3 |
| 44575.010416666664 | 3.76 |
| 44575.020833333336 | 3.58 |
| 44575.03125 | 3.98 |
| 44575.041666666664 | 3.55 |
| 44575.052083333336 | 3.6 |
| 44575.0625 | 3.51 |
| 44575.072916666664 | 3.86 |
| 44575.083333333336 | 3.73 |
| 44575.09375 | 3.74 |
| 44575.104166666664 | 3.9 |
| 44575.114583333336 | 3.78 |
| 44575.125 | 3.58 |
| 44575.135416666664 | 3.79 |
| 44575.145833333336 | 3.93 |
| 44575.15625 | 3.99 |
| 44575.166666666664 | 3.92 |
| 44575.177083333336 | 3.89 |
| 44575.1875 | 4.26 |
| 44575.197916666664 | 6.17 |
| 44575.208333333336 | 5.14 |
| 44575.21875 | 4.62 |
| 44575.229166666664 | 4.62 |
| 44575.239583333336 | 4.44 |
| 44575.25 | 4.82 |
| 44575.260416666664 | 4.31 |
| 44575.270833333336 | 4.42 |
| 44575.28125 | 4.36 |
| 44575.291666666664 | 4.36 |
| 44575.302083333336 | 4.59 |
| 44575.3125 | 4.08 |
| 44575.322916666664 | 4.2 |
| 44575.333333333336 | 4.13 |
| 44575.34375 | 4.22 |
| 44575.354166666664 | 4.02 |
| 44575.364583333336 | 4.1 |
| 44575.375 | 4.41 |
| 44575.385416666664 | 4.79 |
| 44575.395833333336 | 4.35 |
| 44575.40625 | 4.57 |
| 44575.416666666664 | 5.04 |
| 44575.427083333336 | 5.12 |
| 44575.4375 | 6.1 |
| 44575.447916666664 | 5.61 |
| 44575.458333333336 | 5.54 |
| 44575.46875 | 5.73 |
| 44575.479166666664 | 5.61 |
| 44575.489583333336 | 6.45 |
| 44575.5 | 6.39 |
| 44575.510416666664 | 5.71 |
| 44575.520833333336 | 6.22 |
| 44575.53125 | 5.2 |
| 44575.541666666664 | 5.09 |
| 44575.552083333336 | 4.66 |
| 44575.5625 | 4.86 |
| 44575.572916666664 | 4.64 |
| 44575.583333333336 | 4.06 |
| 44575.59375 | 1.86 |
| 44575.604166666664 | 1.32 |
| 44575.614583333336 | 1.1 |
| 44575.625 | 1.12 |
| 44575.635416666664 | 0.93 |
| 44575.645833333336 | 1.28 |
| 44575.65625 | 1.17 |
| 44575.666666666664 | 1.08 |
| 44575.677083333336 | 1.18 |
| 44575.6875 | 0.84 |
| 44575.697916666664 | 0.96 |
| 44575.708333333336 | 0.85 |
| 44575.71875 | 0.9 |
| 44575.729166666664 | 1.07 |
| 44575.739583333336 | 1.49 |
| 44575.75 | 1.01 |
| 44575.760416666664 | 1.56 |
| 44575.770833333336 | 1.72 |
| 44575.78125 | 1.72 |
| 44575.791666666664 | 1.64 |
| 44575.802083333336 | 1.96 |
| 44575.8125 | 1.91 |
| 44575.822916666664 | 2.53 |
| 44575.833333333336 | 3.18 |
| 44575.84375 | 4.09 |
| 44575.854166666664 | 3.6 |
| 44575.864583333336 | 4.09 |
| 44575.875 | 4.64 |
| 44575.885416666664 | 5.19 |
| 44575.895833333336 | 4.87 |
| 44575.90625 | 5.03 |
| 44575.916666666664 | 4.93 |
| 44575.927083333336 | 5.71 |
| 44575.9375 | 5.13 |
| 44575.947916666664 | 6.25 |
| 44575.958333333336 | 5.21 |
| 44575.96875 | 5.35 |
| 44575.979166666664 | 5.89 |
| 44575.989583333336 | 8.26 |
| 44576.0 | 5.66 |
| 44576.010416666664 | 5.63 |
| 44576.020833333336 | 5.79 |
| 44576.03125 | 6.55 |
| 44576.041666666664 | 5.06 |
| 44576.052083333336 | 6.27 |
| 44576.0625 | 5.93 |
| 44576.072916666664 | 5.13 |
| 44576.083333333336 | 5.52 |
| 44576.09375 | 5.55 |
| 44576.104166666664 | 5.19 |
| 44576.114583333336 | 5.26 |
| 44576.125 | 5.39 |
| 44576.135416666664 | 5.45 |
| 44576.145833333336 | 5.11 |
| 44576.15625 | 5.45 |
| 44576.166666666664 | 5.24 |
| 44576.177083333336 | 5.58 |
| 44576.1875 | 5.96 |
| 44576.197916666664 | 5.91 |
| 44576.208333333336 | 5.72 |
| 44576.21875 | 5.81 |
| 44576.229166666664 | 6.24 |
| 44576.239583333336 | 7.9 |
| 44576.25 | 4.9 |
| 44576.260416666664 | 6.97 |
| 44576.270833333336 | 6.93 |
| 44576.28125 | 6.94 |
| 44576.291666666664 | 8.49 |
| 44576.302083333336 | 5.8 |
| 44576.3125 | 7.33 |
| 44576.322916666664 | 5.88 |
| 44576.333333333336 | 5.04 |
| 44576.34375 | 4.59 |
| 44576.354166666664 | 4.5 |
| 44576.364583333336 | 4.98 |
| 44576.375 | 5.86 |
| 44576.385416666664 | 5.52 |
| 44576.395833333336 | 6.08 |
| 44576.40625 | 3.79 |
| 44576.416666666664 | 5.8 |
| 44576.427083333336 | 6.34 |
| 44576.4375 | 6.58 |
| 44576.447916666664 | 6.81 |
| 44576.458333333336 | 6.72 |
| 44576.46875 | 7 |
| 44576.479166666664 | 10.16 |
| 44576.489583333336 | 8.24 |
| 44576.5 | 8.75 |
| 44576.510416666664 | 7.99 |
| 44576.520833333336 | 6.41 |
| 44576.53125 | 6.98 |
| 44576.541666666664 | 7.61 |
| 44576.552083333336 | 7.01 |
| 44576.5625 | 5.4 |
| 44576.572916666664 | 4.31 |
| 44576.583333333336 | 4.48 |
| 44576.59375 | 3.12 |
| 44576.604166666664 | 2.93 |
| 44576.614583333336 | 2.78 |
| 44576.625 | 1.67 |
| 44576.635416666664 | 1.59 |
| 44576.645833333336 | 1.32 |
| 44576.65625 | 1.19 |
| 44576.666666666664 | 1.18 |
| 44576.677083333336 | 1.56 |
| 44576.6875 | 1.35 |
| 44576.697916666664 | 1.93 |
| 44576.708333333336 | 1.69 |
| 44576.71875 | 1.4 |
| 44576.729166666664 | 1.73 |
| 44576.739583333336 | 2.42 |
| 44576.75 | 2.92 |
| 44576.760416666664 | 3.66 |
| 44576.770833333336 | 4.34 |
| 44576.78125 | 3.76 |
| 44576.791666666664 | 2.09 |
| 44576.802083333336 | 2.67 |
| 44576.8125 | 3.4 |
| 44576.822916666664 | 4.84 |
| 44576.833333333336 | 5.05 |
| 44576.84375 | 5.23 |
| 44576.854166666664 | 6.45 |
| 44576.864583333336 | 5.35 |
| 44576.875 | 6.05 |
| 44576.885416666664 | 6.16 |
| 44576.895833333336 | 5.84 |
| 44576.90625 | 5.86 |
| 44576.916666666664 | 6.12 |
| 44576.927083333336 | 6.71 |
| 44576.9375 | 6.14 |
| 44576.947916666664 | 10.34 |
| 44576.958333333336 | 6.14 |
| 44576.96875 | 7.4 |
| 44576.979166666664 | 5.75 |
| 44576.989583333336 | 7.15 |
| 44577.0 | 7.96 |
| 44577.010416666664 | 7.31 |
| 44577.020833333336 | 6.75 |
| 44577.03125 | 6.8 |
| 44577.041666666664 | 7.88 |
| 44577.052083333336 | 6.17 |
| 44577.0625 | 6.58 |
| 44577.072916666664 | 8.44 |
| 44577.083333333336 | 6.23 |
| 44577.09375 | 6.82 |
| 44577.104166666664 | 6.84 |
| 44577.114583333336 | 5.93 |
| 44577.125 | 7.08 |
| 44577.135416666664 | 6.81 |
| 44577.145833333336 | 6.09 |
| 44577.15625 | 6.26 |
| 44577.166666666664 | 6.65 |
| 44577.177083333336 | 6.3 |
| 44577.1875 | 6.18 |
| 44577.197916666664 | 6.62 |
| 44577.208333333336 | 6.98 |
| 44577.21875 | 6.66 |
| 44577.229166666664 | 6.86 |
| 44577.239583333336 | 7.72 |
| 44577.25 | 6.68 |
| 44577.260416666664 | 8.51 |
| 44577.270833333336 | 9.38 |
| 44577.28125 | 9.58 |
| 44577.291666666664 | 7.47 |
| 44577.302083333336 | 7.64 |
| 44577.3125 | 7.6 |
| 44577.322916666664 | 7.49 |
| 44577.333333333336 | 7.9 |
| 44577.34375 | 7.07 |
| 44577.354166666664 | 7.57 |
| 44577.364583333336 | 5.95 |
| 44577.375 | 6.97 |
| 44577.385416666664 | 6.47 |
| 44577.395833333336 | 6.9 |
| 44577.40625 | 6.89 |
| 44577.416666666664 | 6.7 |
| 44577.427083333336 | 6.74 |
| 44577.4375 | 9.19 |
| 44577.447916666664 | 6.98 |
| 44577.458333333336 | 7.24 |
| 44577.46875 | 5.37 |
| 44577.479166666664 | 7.71 |
| 44577.489583333336 | 7.95 |
| 44577.5 | 14 |
| 44577.510416666664 | 7.44 |
| 44577.520833333336 | 9.67 |
| 44577.53125 | 7.24 |
| 44577.541666666664 | 8.7 |
| 44577.552083333336 | 8.48 |
| 44577.5625 | 7.37 |
| 44577.572916666664 | 8.29 |
| 44577.583333333336 | 7.65 |
| 44577.59375 | 6.61 |
| 44577.604166666664 | 6.34 |
| 44577.614583333336 | 5.32 |
| 44577.625 | 6.07 |
| 44577.635416666664 | 6.67 |
| 44577.645833333336 | 5.23 |
| 44577.65625 | 3.92 |
| 44577.666666666664 | 3.76 |
| 44577.677083333336 | 4.48 |
| 44577.6875 | 3.48 |
| 44577.697916666664 | 4.08 |
| 44577.708333333336 | 4.6 |
| 44577.71875 | 5.2 |
| 44577.729166666664 | 5.5 |
| 44577.739583333336 | 5.34 |
| 44577.75 | 6.3 |
| 44577.760416666664 | 6.23 |
| 44577.770833333336 | 5.98 |
| 44577.78125 | 6.6 |
| 44577.791666666664 | 7.07 |
| 44577.802083333336 | 7.29 |
| 44577.8125 | 7.45 |
| 44577.822916666664 | 7.88 |
| 44577.833333333336 | 7.61 |
| 44577.84375 | 7.32 |
| 44577.854166666664 | 7.99 |
| 44577.864583333336 | 7.79 |
| 44577.875 | 7.94 |
| 44577.885416666664 | 8.26 |
| 44577.895833333336 | 7.79 |
| 44577.90625 | 7.68 |
| 44577.916666666664 | 8.22 |
| 44577.927083333336 | 8.63 |
| 44577.9375 | 8.59 |
| 44577.947916666664 | 8.97 |
| 44577.958333333336 | 9.28 |
| 44577.96875 | 9.19 |
| 44577.979166666664 | 8.89 |
| 44577.989583333336 | 9.25 |
| 44578.0 | 7.56 |
| 44578.010416666664 | 8.01 |
| 44578.020833333336 | 8.18 |
| 44578.03125 | 8.41 |
| 44578.041666666664 | 8.47 |
| 44578.052083333336 | 8.53 |
| 44578.0625 | 8.23 |
| 44578.072916666664 | 8.06 |
| 44578.083333333336 | 8.6 |
| 44578.09375 | 8.98 |
| 44578.104166666664 | 8.84 |
| 44578.114583333336 | 8.6 |
| 44578.125 | 8.95 |
| 44578.135416666664 | 8.84 |
| 44578.145833333336 | 9.9 |
| 44578.15625 | 9.15 |
| 44578.166666666664 | 9.37 |
| 44578.177083333336 | 10.4 |
| 44578.1875 | 10.2 |
| 44578.197916666664 | 9.36 |
| 44578.208333333336 | 11.63 |
| 44578.21875 | 8.73 |
| 44578.229166666664 | 9.52 |
| 44578.239583333336 | 7.78 |
| 44578.25 | 9.16 |
| 44578.260416666664 | 10.45 |
| 44578.270833333336 | 10.09 |
| 44578.28125 | 10.82 |
| 44578.291666666664 | 11.12 |
| 44578.302083333336 | 10.88 |
| 44578.3125 | 12.46 |
| 44578.322916666664 | 10.49 |
| 44578.333333333336 | 10.63 |
| 44578.34375 | 10.76 |
| 44578.354166666664 | 9.88 |
| 44578.364583333336 | 13.34 |
| 44578.375 | 10.61 |
| 44578.385416666664 | 14.11 |
| 44578.395833333336 | 11.44 |
| 44578.40625 | 11.36 |
| 44578.416666666664 | 10.54 |
| 44578.427083333336 | 12.73 |
| 44578.4375 | 11.17 |
| 44578.447916666664 | 11.34 |
| 44578.458333333336 | 11.66 |
| 44578.46875 | 10.78 |
| 44578.479166666664 | 13.33 |
| 44578.489583333336 | 10.11 |
| 44578.5 | 10.44 |
| 44578.510416666664 | 12.83 |
| 44578.520833333336 | 11.04 |
| 44578.53125 | 9.9 |
| 44578.541666666664 | 10.37 |
| 44578.552083333336 | 12.72 |
| 44578.5625 | 10.17 |
| 44578.572916666664 | 9.97 |
| 44578.583333333336 | 9.96 |
| 44578.59375 | 7.67 |
| 44578.604166666664 | 8.65 |
| 44578.614583333336 | 8.96 |
| 44578.625 | 7.49 |
| 44578.635416666664 | 8.96 |
| 44578.645833333336 | 4.89 |
| 44578.65625 | 6.37 |
| 44578.666666666664 | 5.41 |
| 44578.677083333336 | 8.15 |
| 44578.6875 | 6.84 |
| 44578.697916666664 | 8.37 |
| 44578.708333333336 | 9.87 |
| 44578.71875 | 8.84 |
| 44578.729166666664 | 10.17 |
| 44578.739583333336 | 9.26 |
| 44578.75 | 10.09 |
| 44578.760416666664 | 8.83 |
| 44578.770833333336 | 9.35 |
| 44578.78125 | 10.04 |
| 44578.791666666664 | 7.41 |
| 44578.802083333336 | 9.41 |
| 44578.8125 | 9.02 |
| 44578.822916666664 | 10.14 |
| 44578.833333333336 | 9.55 |
| 44578.84375 | 10.09 |
| 44578.854166666664 | 10.86 |
| 44578.864583333336 | 11.74 |
| 44578.875 | 12.5 |
| 44578.885416666664 | 14.24 |
| 44578.895833333336 | 12.39 |
| 44578.90625 | 12.93 |
| 44578.916666666664 | 13.27 |
| 44578.927083333336 | 14.8 |
| 44578.9375 | 12.25 |
| 44578.947916666664 | 13.86 |
| 44578.958333333336 | 25.69 |
| 44578.96875 | 13.17 |
| 44578.979166666664 | 12.86 |
| 44578.989583333336 | 12.5 |
| 44579.0 | 12.4 |
| 44579.010416666664 | 16.29 |
| 44579.020833333336 | 14.37 |
| 44579.03125 | 12.89 |
| 44579.041666666664 | 14.76 |
| 44579.052083333336 | 16.03 |
| 44579.0625 | 13.78 |
| 44579.072916666664 | 12.25 |
| 44579.083333333336 | 21.55 |
| 44579.09375 | 13.84 |
| 44579.104166666664 | 12.8 |
| 44579.114583333336 | 13.07 |
| 44579.125 | 12.81 |
| 44579.135416666664 | 12.37 |
| 44579.145833333336 | 13.04 |
| 44579.15625 | 12.8 |
| 44579.166666666664 | 10.21 |
| 44579.177083333336 | 11.98 |
| 44579.1875 | 10.74 |
| 44579.197916666664 | 10.13 |
| 44579.208333333336 | 12.05 |
| 44579.21875 | 11.93 |
| 44579.229166666664 | 10.08 |
| 44579.239583333336 | 13.81 |
| 44579.25 | 9.23 |
| 44579.260416666664 | 10.27 |
| 44579.270833333336 | 11.52 |
| 44579.28125 | 10.5 |
| 44579.291666666664 | 11.04 |
| 44579.302083333336 | 10.86 |
| 44579.3125 | 13.8 |
| 44579.322916666664 | 14.91 |
| 44579.333333333336 | 13.96 |
| 44579.34375 | 15.73 |
| 44579.354166666664 | 9.9 |
| 44579.364583333336 | 19.83 |
| 44579.375 | 11.29 |
| 44579.385416666664 | 13.55 |
| 44579.395833333336 | 14.74 |
| 44579.40625 | 13.67 |
| 44579.416666666664 | 13.82 |
| 44579.427083333336 | 12.75 |
| 44579.4375 | 13.11 |
| 44579.447916666664 | 12.42 |
| 44579.458333333336 | 11.79 |
| 44579.46875 | 12.62 |
| 44579.479166666664 | 11.22 |
| 44579.489583333336 | 12.94 |
| 44579.5 | 12.37 |
| 44579.510416666664 | 14.32 |
| 44579.520833333336 | 13.16 |
| 44579.53125 | 15.91 |
| 44579.541666666664 | 11.97 |
| 44579.552083333336 | 11.76 |
| 44579.5625 | 14.97 |
| 44579.572916666664 | 12.27 |
| 44579.583333333336 | 9.58 |
| 44579.59375 | 9.02 |
| 44579.604166666664 | 10.31 |
| 44579.614583333336 | 9.18 |
| 44579.625 | 6.36 |
| 44579.635416666664 | 5.7 |
| 44579.645833333336 | 4.29 |
| 44579.65625 | 5.76 |
| 44579.666666666664 | 6.97 |
| 44579.677083333336 | 9.36 |
| 44579.6875 | 8.43 |
| 44579.697916666664 | 7.93 |
| 44579.708333333336 | 7.56 |
| 44579.71875 | 6.18 |
| 44579.729166666664 | 5.87 |
| 44579.739583333336 | 6.46 |
| 44579.75 | 6.71 |
| 44579.760416666664 | 5.49 |
| 44579.770833333336 | 5.23 |
| 44579.78125 | 8.58 |
| 44579.791666666664 | 6.32 |
| 44579.802083333336 | 9.77 |
| 44579.8125 | 8.73 |
| 44579.822916666664 | 9.77 |
| 44579.833333333336 | 10.01 |
| 44579.84375 | 8.73 |
| 44579.854166666664 | 10.35 |
| 44579.864583333336 | 10.89 |
| 44579.875 | 11.82 |
| 44579.885416666664 | 9.35 |
| 44579.895833333336 | 12.31 |
| 44579.90625 | 13.71 |
| 44579.916666666664 | 13.4 |
| 44579.927083333336 | 13.2 |
| 44579.9375 | 11.93 |
| 44579.947916666664 | 11.91 |
| 44579.958333333336 | 11.67 |
| 44579.96875 | 11.26 |
| 44579.979166666664 | 11.79 |
| 44579.989583333336 | 11.92 |
| 44580.0 | 12.41 |
| 44580.010416666664 | 11.56 |
| 44580.020833333336 | 11.96 |
| 44580.03125 | 12.69 |
| 44580.041666666664 | 10.1 |
| 44580.052083333336 | 14.43 |
| 44580.0625 | 12.58 |
| 44580.072916666664 | 12.29 |
| 44580.083333333336 | 12.79 |
| 44580.09375 | 15.2 |
| 44580.104166666664 | 12.2 |
| 44580.114583333336 | 11.75 |
| 44580.125 | 11.99 |
| 44580.135416666664 | 10.86 |
| 44580.145833333336 | 10.2 |
| 44580.15625 | 10.86 |
| 44580.166666666664 | 9.69 |
| 44580.177083333336 | 12.33 |
| 44580.1875 | 10.85 |
| 44580.197916666664 | 11.81 |
| 44580.208333333336 | 11.69 |
| 44580.21875 | 11.6 |
| 44580.229166666664 | 11.18 |
| 44580.239583333336 | 10.45 |
| 44580.25 | 9.03 |
| 44580.260416666664 | 10.38 |
| 44580.270833333336 | 10.81 |
| 44580.28125 | 9.81 |
| 44580.291666666664 | 11.07 |
| 44580.302083333336 | 11.19 |
| 44580.3125 | 16.59 |
| 44580.322916666664 | 18.7 |
| 44580.333333333336 | 14.01 |
| 44580.34375 | 12.12 |
| 44580.354166666664 | 11.92 |
| 44580.364583333336 | 15.06 |
| 44580.375 | 13.74 |
| 44580.385416666664 | 14.21 |
| 44580.395833333336 | 10.97 |
| 44580.40625 | 12.64 |
| 44580.416666666664 | 12.62 |
| 44580.427083333336 | 13.82 |
| 44580.4375 | 11.2 |
| 44580.447916666664 | 10.8 |
| 44580.458333333336 | 10.35 |
| 44580.46875 | 10.26 |
| 44580.479166666664 | 10.73 |
| 44580.489583333336 | 10.12 |
| 44580.5 | 11 |
| 44580.510416666664 | 12.02 |
| 44580.520833333336 | 10.99 |
| 44580.53125 | 10.82 |
| 44580.541666666664 | 11.74 |
| 44580.552083333336 | 10.4 |
| 44580.5625 | 10.48 |
| 44580.572916666664 | 5.73 |
| 44580.583333333336 | 6.82 |
| 44580.59375 | 3.81 |
| 44580.604166666664 | 3.88 |
| 44580.614583333336 | 6.32 |
| 44580.625 | 9.63 |
| 44580.635416666664 | 4.45 |
| 44580.645833333336 | 3 |
| 44580.65625 | 5.26 |
| 44580.666666666664 | 2.23 |
| 44580.677083333336 | 1.87 |
| 44580.6875 | 2.38 |
| 44580.697916666664 | 2.94 |
| 44580.708333333336 | 2.69 |
| 44580.71875 | 3.13 |
| 44580.729166666664 | 3.83 |
| 44580.739583333336 | 4.6 |
| 44580.75 | 6 |
| 44580.760416666664 | 5.48 |
| 44580.770833333336 | 5.67 |
| 44580.78125 | 6.82 |
| 44580.791666666664 | 8.59 |
| 44580.802083333336 | 7.89 |
| 44580.8125 | 10.38 |
| 44580.833333333336 | 5.22 |
| 44580.84375 | 11.05 |
| 44580.854166666664 | 11 |
| 44580.864583333336 | 12.11 |
| 44580.875 | 11.49 |
| 44580.885416666664 | 14.07 |
| 44580.895833333336 | 12.76 |
| 44580.90625 | 12.47 |
| 44580.916666666664 | 14.27 |
| 44580.927083333336 | 13.82 |
| 44580.9375 | 16.91 |
| 44580.947916666664 | 13.4 |
| 44580.958333333336 | 13.04 |
| 44580.96875 | 14.67 |
| 44580.979166666664 | 13.84 |
| 44580.989583333336 | 12.78 |
| 44581.0 | 13.3 |
| 44581.010416666664 | 16.6 |
| 44581.020833333336 | 12.43 |
| 44581.03125 | 9.58 |
| 44581.041666666664 | 11.42 |
| 44581.052083333336 | 11 |
| 44581.0625 | 13.4 |
| 44581.072916666664 | 11.89 |
| 44581.083333333336 | 16.9 |
| 44581.09375 | 12.09 |
| 44581.104166666664 | 15.65 |
| 44581.114583333336 | 13.57 |
| 44581.125 | 15.11 |
| 44581.135416666664 | 12.34 |
| 44581.145833333336 | 11.51 |
| 44581.15625 | 12.87 |
| 44581.166666666664 | 10.9 |
| 44581.177083333336 | 10.44 |
| 44581.1875 | 12.48 |
| 44581.197916666664 | 10.77 |
| 44581.208333333336 | 15.66 |
| 44581.21875 | 12.44 |
| 44581.229166666664 | 10.64 |
| 44581.239583333336 | 9.02 |
| 44581.25 | 13.78 |
| 44581.260416666664 | 13.72 |
| 44581.270833333336 | 12.59 |
| 44581.28125 | 9.06 |
| 44581.291666666664 | 12 |
| 44581.302083333336 | 11.86 |
| 44581.3125 | 12.69 |
| 44581.322916666664 | 12.37 |
| 44581.333333333336 | 12.86 |
| 44581.34375 | 14.06 |
| 44581.354166666664 | 14.78 |
| 44581.364583333336 | 11.89 |
| 44581.375 | 14.79 |
| 44581.385416666664 | 15.7 |
| 44581.395833333336 | 11.31 |
| 44581.40625 | 15.78 |
| 44581.416666666664 | 16.89 |
| 44581.427083333336 | 13.33 |
| 44581.4375 | 12.84 |
| 44581.447916666664 | 11.96 |
| 44581.458333333336 | 14.27 |
| 44581.46875 | 9.37 |
| 44581.479166666664 | 11.57 |
| 44581.489583333336 | 9.83 |
| 44581.5 | 11.55 |
| 44581.510416666664 | 9.03 |
| 44581.520833333336 | 10.09 |
| 44581.53125 | 8.88 |
| 44581.541666666664 | 10.1 |
| 44581.552083333336 | 12.72 |
| 44581.5625 | 10.88 |
| 44581.572916666664 | 10.96 |
| 44581.583333333336 | 10.57 |
| 44581.59375 | 8.94 |
| 44581.604166666664 | 9.49 |
| 44581.614583333336 | 9.75 |
| 44581.625 | 7.76 |
| 44581.635416666664 | 10.4 |
| 44581.645833333336 | 11 |
| 44581.65625 | 8.67 |
| 44581.666666666664 | 9.41 |
| 44581.677083333336 | 9.43 |
| 44581.6875 | 9.24 |
| 44581.697916666664 | 8.82 |
| 44581.708333333336 | 9.23 |
| 44581.71875 | 9.69 |
| 44581.729166666664 | 9.34 |
| 44581.739583333336 | 9.51 |
| 44581.75 | 10.54 |
| 44581.760416666664 | 11.36 |
| 44581.770833333336 | 11.1 |
| 44581.78125 | 12.82 |
| 44581.791666666664 | 11.67 |
| 44581.802083333336 | 13.09 |
| 44581.8125 | 13.33 |
| 44581.822916666664 | 13.34 |
| 44581.833333333336 | 13.13 |
| 44581.84375 | 13.15 |
| 44581.854166666664 | 12.32 |
| 44581.864583333336 | 12.2 |
| 44581.875 | 15.42 |
| 44581.885416666664 | 19.76 |
| 44581.895833333336 | 13.29 |
| 44581.90625 | 17.64 |
| 44581.916666666664 | 23.8 |
| 44581.927083333336 | 22.17 |
| 44581.9375 | 30.48 |
| 44581.947916666664 | 20.76 |
| 44581.958333333336 | 16.83 |
| 44581.96875 | 21.21 |
| 44581.979166666664 | 32.53 |
| 44581.989583333336 | 15.96 |
| 44582.0 | 20.55 |
| 44582.010416666664 | 14.78 |
| 44582.020833333336 | 12.47 |
| 44582.03125 | 13.52 |
| 44582.041666666664 | 14.58 |
| 44582.052083333336 | 10.96 |
| 44582.0625 | 11.43 |
| 44582.072916666664 | 10.62 |
| 44582.083333333336 | 11.47 |
| 44582.09375 | 13.23 |
| 44582.104166666664 | 12.53 |
| 44582.114583333336 | 12.94 |
| 44582.125 | 12.81 |
| 44582.135416666664 | 14.98 |
| 44582.145833333336 | 10.89 |
| 44582.15625 | 12.17 |
| 44582.166666666664 | 14.81 |
| 44582.177083333336 | 10.98 |
| 44582.1875 | 10.15 |
| 44582.197916666664 | 10.58 |
| 44582.208333333336 | 12.99 |
| 44582.21875 | 10.36 |
| 44582.229166666664 | 9.67 |
| 44582.239583333336 | 12.82 |
| 44582.25 | 15.18 |
| 44582.260416666664 | 10.57 |
| 44582.270833333336 | 10.09 |
| 44582.28125 | 14.37 |
| 44582.291666666664 | 15.9 |
| 44582.302083333336 | 12.69 |
| 44582.3125 | 14.03 |
| 44582.322916666664 | 13.37 |
| 44582.333333333336 | 13.17 |
| 44582.34375 | 13.67 |
| 44582.354166666664 | 15.71 |
| 44582.364583333336 | 13.1 |
| 44582.375 | 14.27 |
| 44582.385416666664 | 15.03 |
| 44582.395833333336 | 17.36 |
| 44582.40625 | 16.45 |
| 44582.416666666664 | 22.56 |
| 44582.427083333336 | 16.68 |
| 44582.4375 | 15.36 |
| 44582.447916666664 | 18.85 |
| 44582.458333333336 | 16.26 |
| 44582.46875 | 15.69 |
| 44582.479166666664 | 13.82 |
| 44582.489583333336 | 9.71 |
| 44582.5 | 12.55 |
| 44582.510416666664 | 16.05 |
| 44582.520833333336 | 14.17 |
| 44582.53125 | 12.38 |
| 44582.541666666664 | 12.46 |
| 44582.552083333336 | 12.93 |
| 44582.5625 | 11.11 |
| 44582.572916666664 | 12.43 |
| 44582.583333333336 | 13.54 |
| 44582.59375 | 13.1 |
| 44582.604166666664 | 12.65 |
| 44582.614583333336 | 13.23 |
| 44582.625 | 13.11 |
| 44582.635416666664 | 11.1 |
| 44582.645833333336 | 12.59 |
| 44582.65625 | 12.17 |
| 44582.666666666664 | 11.43 |
| 44582.677083333336 | 11.69 |
| 44582.6875 | 10.5 |
| 44582.697916666664 | 11.16 |
| 44582.708333333336 | 9.32 |
| 44582.71875 | 9.05 |
| 44582.729166666664 | 8.95 |
| 44582.739583333336 | 7.98 |
| 44582.75 | 8.21 |
| 44582.760416666664 | 8.74 |
| 44582.770833333336 | 7.91 |
| 44582.78125 | 9.79 |
| 44582.791666666664 | 7.8 |
| 44582.802083333336 | 9.3 |
| 44582.8125 | 14.13 |
| 44582.822916666664 | 12.39 |
| 44582.833333333336 | 12.2 |
| 44582.84375 | 13.21 |
| 44582.854166666664 | 13.14 |
| 44582.864583333336 | 14.22 |
| 44582.875 | 14.04 |
| 44582.885416666664 | 15.78 |
| 44582.895833333336 | 14.76 |
| 44582.90625 | 12.9 |
| 44582.916666666664 | 14.55 |
| 44582.927083333336 | 18.53 |
| 44582.9375 | 19.24 |
| 44582.947916666664 | 19.52 |
| 44582.958333333336 | 14.46 |
| 44582.96875 | 15.26 |
| 44582.979166666664 | 15.69 |
| 44582.989583333336 | 15.93 |
| 44583.0 | 13.1 |
| 44583.010416666664 | 14.99 |
| 44583.020833333336 | 16.27 |
| 44583.03125 | 17.33 |
| 44583.041666666664 | 13.5 |
| 44583.052083333336 | 13.97 |
| 44583.0625 | 12.83 |
| 44583.072916666664 | 11.55 |
| 44583.083333333336 | 14.92 |
| 44583.09375 | 15.07 |
| 44583.104166666664 | 15.56 |
| 44583.114583333336 | 13.72 |
| 44583.125 | 12.65 |
| 44583.135416666664 | 12.34 |
| 44583.145833333336 | 16.7 |
| 44583.15625 | 14.83 |
| 44583.166666666664 | 17.04 |
| 44583.177083333336 | 11.6 |
| 44583.1875 | 12.61 |
| 44583.197916666664 | 21.17 |
| 44583.208333333336 | 13.53 |
| 44583.21875 | 13.64 |
| 44583.229166666664 | 17.55 |
| 44583.239583333336 | 15.26 |
| 44583.25 | 12.84 |
| 44583.260416666664 | 16.28 |
| 44583.270833333336 | 9.35 |
| 44583.28125 | 10.47 |
| 44583.291666666664 | 12.76 |
| 44583.302083333336 | 10.92 |
| 44583.3125 | 10.09 |
| 44583.322916666664 | 20.75 |
| 44583.333333333336 | 15.2 |
| 44583.34375 | 16.03 |
| 44583.354166666664 | 13.31 |
| 44583.364583333336 | 12.17 |
| 44583.375 | 15.75 |
| 44583.385416666664 | 15.77 |
| 44583.395833333336 | 19.84 |
| 44583.40625 | 15.21 |
| 44583.416666666664 | 13.57 |
| 44583.427083333336 | 15.14 |
| 44583.4375 | 19.05 |
| 44583.447916666664 | 16.45 |
| 44583.458333333336 | 17.32 |
| 44583.46875 | 19.09 |
| 44583.479166666664 | 15.35 |
| 44583.489583333336 | 15.85 |
| 44583.5 | 17.28 |
| 44583.510416666664 | 15.39 |
| 44583.520833333336 | 16.08 |
| 44583.53125 | 19.91 |
| 44583.541666666664 | 17.41 |
| 44583.552083333336 | 12.91 |
| 44583.5625 | 11.29 |
| 44583.572916666664 | 10.13 |
| 44583.583333333336 | 10.27 |
| 44583.59375 | 7.74 |
| 44583.604166666664 | 6.08 |
| 44583.614583333336 | 6.44 |
| 44583.625 | 5.51 |
| 44583.635416666664 | 4.5 |
| 44583.645833333336 | 5.2 |
| 44583.65625 | 5.61 |
| 44583.666666666664 | 4.16 |
| 44583.677083333336 | 4.15 |
| 44583.6875 | 4.61 |
| 44583.697916666664 | 6.57 |
| 44583.708333333336 | 4.48 |
| 44583.71875 | 6.39 |
| 44583.729166666664 | 4.07 |
| 44583.739583333336 | 3.29 |
| 44583.75 | 2.67 |
| 44583.760416666664 | 2.42 |
| 44583.770833333336 | 2.11 |
| 44583.78125 | 2.3 |
| 44583.791666666664 | 2.38 |
| 44583.802083333336 | 2.48 |
| 44583.8125 | 2.8 |
| 44583.822916666664 | 3.14 |
| 44583.833333333336 | 10.29 |
| 44583.84375 | 9.93 |
| 44583.854166666664 | 12.94 |
| 44583.864583333336 | 11.9 |
| 44583.875 | 12.37 |
| 44583.885416666664 | 8.69 |
| 44583.895833333336 | 9.36 |
| 44583.90625 | 10.6 |
| 44583.916666666664 | 10.88 |
| 44583.927083333336 | 11.44 |
| 44583.9375 | 12.55 |
| 44583.947916666664 | 12.32 |
| 44583.958333333336 | 13.8 |
| 44583.96875 | 14.09 |
| 44583.979166666664 | 13.15 |
| 44583.989583333336 | 17.91 |
| 44584.0 | 14.77 |
| 44584.010416666664 | 13.58 |
| 44584.020833333336 | 14.62 |
| 44584.03125 | 13 |
| 44584.041666666664 | 13.64 |
| 44584.052083333336 | 16.02 |
| 44584.0625 | 11.17 |
| 44584.072916666664 | 11.52 |
| 44584.083333333336 | 12.19 |
| 44584.09375 | 10.28 |
| 44584.104166666664 | 11.45 |
| 44584.114583333336 | 10.98 |
| 44584.125 | 11.38 |
| 44584.135416666664 | 10.59 |
| 44584.145833333336 | 11.57 |
| 44584.15625 | 12.65 |
| 44584.166666666664 | 11.96 |
| 44584.177083333336 | 15.33 |
| 44584.1875 | 12.4 |
| 44584.197916666664 | 13.01 |
| 44584.208333333336 | 14.99 |
| 44584.21875 | 15.53 |
| 44584.229166666664 | 12.68 |
| 44584.239583333336 | 13.3 |
| 44584.25 | 9.3 |
| 44584.260416666664 | 12.1 |
| 44584.270833333336 | 11.82 |
| 44584.28125 | 12.01 |
| 44584.291666666664 | 11.75 |
| 44584.302083333336 | 12.07 |
| 44584.3125 | 12.76 |
| 44584.322916666664 | 11.46 |
| 44584.333333333336 | 11.55 |
| 44584.34375 | 11.6 |
| 44584.354166666664 | 11.59 |
| 44584.364583333336 | 11.43 |
| 44584.375 | 10.59 |
| 44584.385416666664 | 12.06 |
| 44584.395833333336 | 11.66 |
| 44584.40625 | 11.53 |
| 44584.416666666664 | 11.43 |
| 44584.427083333336 | 12.48 |
| 44584.4375 | 12.35 |
| 44584.447916666664 | 12.96 |
| 44584.458333333336 | 13.96 |
| 44584.46875 | 15.5 |
| 44584.479166666664 | 14.59 |
| 44584.489583333336 | 11.75 |
| 44584.5 | 12.15 |
| 44584.510416666664 | 13.91 |
| 44584.520833333336 | 14.76 |
| 44584.53125 | 15.78 |
| 44584.541666666664 | 11.98 |
| 44584.552083333336 | 7.36 |
| 44584.5625 | 4.41 |
| 44584.572916666664 | 3.56 |
| 44584.583333333336 | 8.79 |
| 44584.59375 | 6.25 |
| 44584.604166666664 | 3.31 |
| 44584.614583333336 | 3.21 |
| 44584.625 | 2.78 |
| 44584.635416666664 | 2.41 |
| 44584.645833333336 | 2.63 |
| 44584.65625 | 2.91 |
| 44584.666666666664 | 2.98 |
| 44584.677083333336 | 2.28 |
| 44584.6875 | 2.18 |
| 44584.697916666664 | 2.74 |
| 44584.708333333336 | 2.53 |
| 44584.71875 | 2.64 |
| 44584.729166666664 | 6.16 |
| 44584.739583333336 | 3.5 |
| 44584.75 | 2.71 |
| 44584.760416666664 | 2.04 |
| 44584.770833333336 | 1.5 |
| 44584.78125 | 1.41 |
| 44584.791666666664 | 1.59 |
| 44584.802083333336 | 2.93 |
| 44584.8125 | 2.33 |
| 44584.822916666664 | 3.71 |
| 44584.833333333336 | 3.91 |
| 44584.84375 | 3.99 |
| 44584.854166666664 | 3.71 |
| 44584.864583333336 | 3.99 |
| 44584.875 | 5.43 |
| 44584.885416666664 | 6.69 |
| 44584.895833333336 | 7.64 |
| 44584.90625 | 8.7 |
| 44584.916666666664 | 9.85 |
| 44584.927083333336 | 10.33 |
| 44584.9375 | 11.16 |
| 44584.947916666664 | 10.94 |
| 44584.958333333336 | 11.45 |
| 44584.96875 | 12.44 |
| 44584.979166666664 | 14.06 |
| 44584.989583333336 | 13.96 |
| 44585.0 | 12.91 |
| 44585.010416666664 | 14.9 |
| 44585.020833333336 | 10.47 |
| 44585.03125 | 15.13 |
| 44585.041666666664 | 14.03 |
| 44585.052083333336 | 11.7 |
| 44585.0625 | 11.8 |
| 44585.072916666664 | 10.11 |
| 44585.083333333336 | 10.5 |
| 44585.09375 | 11.21 |
| 44585.104166666664 | 11.92 |
| 44585.114583333336 | 12.02 |
| 44585.125 | 11.89 |
| 44585.135416666664 | 10.53 |
| 44585.145833333336 | 10.94 |
| 44585.15625 | 13.35 |
| 44585.166666666664 | 11.58 |
| 44585.177083333336 | 11.52 |
| 44585.1875 | 11.26 |
| 44585.197916666664 | 12.72 |
| 44585.208333333336 | 17.84 |
| 44585.21875 | 10.9 |
| 44585.229166666664 | 34.93 |
| 44585.239583333336 | 10.44 |
| 44585.25 | 14.33 |
| 44585.260416666664 | 11.74 |
| 44585.270833333336 | 14.3 |
| 44585.28125 | 10.88 |
| 44585.291666666664 | 11.15 |
| 44585.302083333336 | 10.05 |
| 44585.3125 | 10.84 |
| 44585.322916666664 | 11.86 |
| 44585.333333333336 | 12.46 |
| 44585.34375 | 11.21 |
| 44585.354166666664 | 11.05 |
| 44585.364583333336 | 10.8 |
| 44585.375 | 11.79 |
| 44585.385416666664 | 31.82 |
| 44585.395833333336 | 11.72 |
| 44585.40625 | 12.32 |
| 44585.416666666664 | 11.65 |
| 44585.427083333336 | 10.27 |
| 44585.4375 | 11.96 |
| 44585.447916666664 | 12.37 |
| 44585.458333333336 | 12.95 |
| 44585.46875 | 12.2 |
| 44585.479166666664 | 12.95 |
| 44585.489583333336 | 14.95 |
| 44585.5 | 15.07 |
| 44585.510416666664 | 16.39 |
| 44585.520833333336 | 13 |
| 44585.53125 | 12.61 |
| 44585.541666666664 | 13.22 |
| 44585.552083333336 | 11.25 |
| 44585.5625 | 9.01 |
| 44585.572916666664 | 10.71 |
| 44585.583333333336 | 11 |
| 44585.59375 | 4.1 |
| 44585.604166666664 | 3.96 |
| 44585.614583333336 | 3.28 |
| 44585.625 | 2.5 |
| 44585.635416666664 | 2.1 |
| 44585.645833333336 | 2.36 |
| 44585.65625 | 2.19 |
| 44585.666666666664 | 2.21 |
| 44585.677083333336 | 2.52 |
| 44585.6875 | 2.19 |
| 44585.697916666664 | 2.23 |
| 44585.708333333336 | 2.01 |
| 44585.71875 | 2.16 |
| 44585.729166666664 | 1.94 |
| 44585.739583333336 | 2.07 |
| 44585.75 | 3.1 |
| 44585.760416666664 | 2.52 |
| 44585.770833333336 | 2.64 |
| 44585.78125 | 1.65 |
| 44585.791666666664 | 1.73 |
| 44585.802083333336 | 2.28 |
| 44585.8125 | 2.62 |
| 44585.822916666664 | 1.82 |
| 44585.833333333336 | 3.09 |
| 44585.84375 | 3.77 |
| 44585.854166666664 | 3.76 |
| 44585.864583333336 | 5.26 |
| 44585.875 | 5.18 |
| 44585.885416666664 | 6.35 |
| 44585.895833333336 | 8.79 |
| 44585.90625 | 8.67 |
| 44585.916666666664 | 9.59 |
| 44585.927083333336 | 10.52 |
| 44585.9375 | 10.87 |
| 44585.947916666664 | 12.3 |
| 44585.958333333336 | 15.44 |
| 44585.96875 | 13.37 |
| 44585.979166666664 | 11.67 |
| 44585.989583333336 | 11.99 |
| 44586.0 | 12.06 |
| 44586.010416666664 | 13.07 |
| 44586.020833333336 | 18.92 |
| 44586.03125 | 12.34 |
| 44586.041666666664 | 13.12 |
| 44586.052083333336 | 14.96 |
| 44586.0625 | 15.97 |
| 44586.072916666664 | 11.47 |
| 44586.083333333336 | 12.04 |
| 44586.09375 | 14.6 |
| 44586.104166666664 | 13.4 |
| 44586.114583333336 | 11.69 |
| 44586.125 | 11.04 |
| 44586.135416666664 | 14.96 |
| 44586.145833333336 | 9.67 |
| 44586.15625 | 14.99 |
| 44586.166666666664 | 9.27 |
| 44586.177083333336 | 14.3 |
| 44586.1875 | 10.28 |
| 44586.197916666664 | 12.31 |
| 44586.208333333336 | 12.14 |
| 44586.21875 | 9.15 |
| 44586.229166666664 | 11.45 |
| 44586.239583333336 | 11.72 |
| 44586.25 | 9.25 |
| 44586.260416666664 | 12.28 |
| 44586.270833333336 | 9.67 |
| 44586.28125 | 10.97 |
| 44586.291666666664 | 10.64 |
| 44586.302083333336 | 10.83 |
| 44586.3125 | 10.37 |
| 44586.322916666664 | 10.7 |
| 44586.333333333336 | 10.03 |
| 44586.34375 | 10.91 |
| 44586.354166666664 | 10.69 |
| 44586.364583333336 | 10.27 |
| 44586.375 | 10.09 |
| 44586.385416666664 | 9.75 |
| 44586.395833333336 | 8.59 |
| 44586.40625 | 10.94 |
| 44586.416666666664 | 12.25 |
| 44586.427083333336 | 11.14 |
| 44586.4375 | 12.15 |
| 44586.447916666664 | 11.85 |
| 44586.458333333336 | 12.4 |
| 44586.46875 | 12.1 |
| 44586.479166666664 | 11.13 |
| 44586.489583333336 | 13.02 |
| 44586.5 | 13.97 |
| 44586.510416666664 | 14.81 |
| 44586.520833333336 | 16.94 |
| 44586.53125 | 16.17 |
| 44586.541666666664 | 14.23 |
| 44586.552083333336 | 15.41 |
| 44586.5625 | 21.6 |
| 44586.572916666664 | 16.93 |
| 44586.583333333336 | 13.22 |
| 44586.59375 | 17.87 |
| 44586.604166666664 | 12.69 |
| 44586.614583333336 | 12.08 |
| 44586.625 | 12.02 |
| 44586.635416666664 | 10.73 |
| 44586.645833333336 | 8.26 |
| 44586.65625 | 7.83 |
| 44586.666666666664 | 6.97 |
| 44586.677083333336 | 8.61 |
| 44586.6875 | 5.86 |
| 44586.697916666664 | 6.36 |
| 44586.708333333336 | 6.25 |
| 44586.71875 | 5.62 |
| 44586.729166666664 | 9.93 |
| 44586.739583333336 | 5.78 |
| 44586.75 | 6.77 |
| 44586.760416666664 | 7.39 |
| 44586.770833333336 | 9.52 |
| 44586.78125 | 10.4 |
| 44586.791666666664 | 8.65 |
| 44586.802083333336 | 5.68 |
| 44586.8125 | 7.65 |
| 44586.822916666664 | 7.36 |
| 44586.833333333336 | 7.6 |
| 44586.84375 | 7.32 |
| 44586.854166666664 | 6.06 |
| 44586.864583333336 | 8.48 |
| 44586.875 | 7.77 |
| 44586.885416666664 | 8.46 |
| 44586.895833333336 | 9.36 |
| 44586.90625 | 11.34 |
| 44586.916666666664 | 12.07 |
| 44586.927083333336 | 13.66 |
| 44586.9375 | 13.44 |
| 44586.947916666664 | 14.68 |
| 44586.958333333336 | 14.15 |
| 44586.96875 | 24.88 |
| 44586.979166666664 | 13.44 |
| 44586.989583333336 | 15.02 |
| 44587.0 | 13.07 |
| 44587.010416666664 | 18.14 |
| 44587.020833333336 | 14.42 |
| 44587.03125 | 13.72 |
| 44587.041666666664 | 18.64 |
| 44587.052083333336 | 19.89 |
| 44587.0625 | 17.89 |
| 44587.072916666664 | 17.31 |
| 44587.083333333336 | 19.11 |
| 44587.09375 | 21.15 |
| 44587.104166666664 | 18.51 |
| 44587.114583333336 | 16.44 |
| 44587.125 | 14.76 |
| 44587.135416666664 | 14.4 |
| 44587.145833333336 | 12.83 |
| 44587.15625 | 12.44 |
| 44587.166666666664 | 13.78 |
| 44587.177083333336 | 11.43 |
| 44587.1875 | 11.77 |
| 44587.197916666664 | 15.96 |
| 44587.208333333336 | 11.28 |
| 44587.21875 | 13.95 |
| 44587.229166666664 | 10.44 |
| 44587.239583333336 | 10.85 |
| 44587.25 | 11.31 |
| 44587.260416666664 | 10.45 |
| 44587.270833333336 | 11.63 |
| 44587.28125 | 9.91 |
| 44587.291666666664 | 9.77 |
| 44587.302083333336 | 14.94 |
| 44587.3125 | 12.02 |
| 44587.322916666664 | 10.86 |
| 44587.333333333336 | 13.77 |
| 44587.34375 | 11.47 |
| 44587.354166666664 | 14.23 |
| 44587.364583333336 | 11.19 |
| 44587.375 | 13.38 |
| 44587.385416666664 | 11.31 |
| 44587.395833333336 | 10.84 |
| 44587.40625 | 13 |
| 44587.416666666664 | 12.79 |
| 44587.427083333336 | 12.98 |
| 44587.4375 | 10.75 |
| 44587.447916666664 | 9.72 |
| 44587.458333333336 | 14.9 |
| 44587.46875 | 11.96 |
| 44587.479166666664 | 12.6 |
| 44587.489583333336 | 15.01 |
| 44587.5 | 13.28 |
| 44587.510416666664 | 15.41 |
| 44587.520833333336 | 14.71 |
| 44587.53125 | 16.18 |
| 44587.541666666664 | 16.21 |
| 44587.552083333336 | 14.07 |
| 44587.5625 | 16.16 |
| 44587.572916666664 | 14 |
| 44587.583333333336 | 14.01 |
| 44587.59375 | 15.46 |
| 44587.604166666664 | 9.08 |
| 44587.614583333336 | 9.89 |
| 44587.625 | 10.13 |
| 44587.635416666664 | 10 |
| 44587.645833333336 | 5.34 |
| 44587.65625 | 6.99 |
| 44587.666666666664 | 4.15 |
| 44587.677083333336 | 4.22 |
| 44587.6875 | 3.37 |
| 44587.697916666664 | 4.46 |
| 44587.708333333336 | 3.19 |
| 44587.71875 | 2.75 |
| 44587.729166666664 | 3.18 |
| 44587.739583333336 | 2.73 |
| 44587.75 | 2.45 |
| 44587.760416666664 | 2.91 |
| 44587.770833333336 | 3.03 |
| 44587.78125 | 3.29 |
| 44587.791666666664 | 3.39 |
| 44587.802083333336 | 3.03 |
| 44587.8125 | 3.88 |
| 44587.822916666664 | 6.31 |
| 44587.833333333336 | 7.23 |
| 44587.84375 | 6.02 |
| 44587.854166666664 | 8.66 |
| 44587.864583333336 | 7.55 |
| 44587.875 | 7.27 |
| 44587.885416666664 | 8.44 |
| 44587.895833333336 | 9.33 |
| 44587.90625 | 9.81 |
| 44587.916666666664 | 10.38 |
| 44587.927083333336 | 11.62 |
| 44587.9375 | 12.19 |
| 44587.947916666664 | 13.2 |
| 44587.958333333336 | 14.83 |
| 44587.96875 | 14.67 |
| 44587.979166666664 | 21.83 |
| 44587.989583333336 | 16.59 |
| 44588.0 | 16.87 |
| 44588.010416666664 | 15.54 |
| 44588.020833333336 | 16.15 |
| 44588.03125 | 16.22 |
| 44588.041666666664 | 16.26 |
| 44588.052083333336 | 17.56 |
| 44588.0625 | 16.25 |
| 44588.072916666664 | 15.62 |
| 44588.083333333336 | 17.33 |
| 44588.09375 | 19.57 |
| 44588.104166666664 | 22.64 |
| 44588.114583333336 | 15.15 |
| 44588.125 | 18.7 |
| 44588.135416666664 | 18.52 |
| 44588.145833333336 | 16 |
| 44588.15625 | 19.18 |
| 44588.166666666664 | 20.11 |
| 44588.177083333336 | 17.39 |
| 44588.1875 | 20.71 |
| 44588.197916666664 | 14.84 |
| 44588.208333333336 | 13.86 |
| 44588.21875 | 14.21 |
| 44588.229166666664 | 13.53 |
| 44588.239583333336 | 16.03 |
| 44588.25 | 12.73 |
| 44588.260416666664 | 11.73 |
| 44588.270833333336 | 11.89 |
| 44588.28125 | 14.49 |
| 44588.291666666664 | 11.48 |
| 44588.302083333336 | 10.43 |
| 44588.3125 | 9.16 |
| 44588.322916666664 | 11.71 |
| 44588.333333333336 | 10.93 |
| 44588.34375 | 12.48 |
| 44588.354166666664 | 12.08 |
| 44588.364583333336 | 15.16 |
| 44588.375 | 13.27 |
| 44588.385416666664 | 12 |
| 44588.395833333336 | 12.03 |
| 44588.40625 | 11.22 |
| 44588.416666666664 | 12.35 |
| 44588.427083333336 | 13.92 |
| 44588.4375 | 514.51 |
| 44588.447916666664 | 58.19 |
| 44588.458333333336 | 41.42 |
| 44588.46875 | 18.99 |
| 44588.479166666664 | 9.05 |
| 44588.489583333336 | 11.07 |
| 44588.5 | 11.65 |
| 44588.510416666664 | 14.41 |
| 44588.520833333336 | 14.93 |
| 44588.53125 | 12.49 |
| 44588.541666666664 | 9.78 |
| 44588.552083333336 | 8.27 |
| 44588.5625 | 7.03 |
| 44588.572916666664 | 5.82 |
| 44588.583333333336 | 4.28 |
| 44588.59375 | 3.97 |
| 44588.604166666664 | 3.39 |
| 44588.614583333336 | 3.33 |
| 44588.625 | 3.82 |
| 44588.635416666664 | 3.79 |
| 44588.645833333336 | 3.33 |
| 44588.65625 | 3.3 |
| 44588.666666666664 | 4.77 |
| 44588.677083333336 | 3.35 |
| 44588.6875 | 2.84 |
| 44588.697916666664 | 2.34 |
| 44588.708333333336 | 2.15 |
| 44588.71875 | 2.61 |
| 44588.729166666664 | 2.51 |
| 44588.739583333336 | 2.62 |
| 44588.75 | 1.72 |
| 44588.760416666664 | 1.97 |
| 44588.770833333336 | 2.17 |
| 44588.78125 | 2.28 |
| 44588.791666666664 | 1.83 |
| 44588.802083333336 | 1.72 |
| 44588.8125 | 2.06 |
| 44588.822916666664 | 2.08 |
| 44588.833333333336 | 2.76 |
| 44588.84375 | 2.37 |
| 44588.854166666664 | 3.9 |
| 44588.864583333336 | 3.27 |
| 44588.875 | 5.37 |
| 44588.885416666664 | 6.05 |
| 44588.895833333336 | 6.13 |
| 44588.90625 | 6.07 |
| 44588.916666666664 | 5.92 |
| 44588.927083333336 | 6.31 |
| 44588.9375 | 7.28 |
| 44588.947916666664 | 7.8 |
| 44588.958333333336 | 7.32 |
| 44588.96875 | 8.07 |
| 44588.979166666664 | 7.54 |
| 44588.989583333336 | 7.97 |
| 44589.0 | 8.29 |
| 44589.010416666664 | 8.42 |
| 44589.020833333336 | 8.77 |
| 44589.03125 | 8.91 |
| 44589.041666666664 | 9.47 |
| 44589.052083333336 | 9.68 |
| 44589.0625 | 9.82 |
| 44589.072916666664 | 10.12 |
| 44589.083333333336 | 9.66 |
| 44589.09375 | 10.5 |
| 44589.104166666664 | 11.03 |
| 44589.114583333336 | 12.02 |
| 44589.125 | 11.91 |
| 44589.135416666664 | 11.26 |
| 44589.145833333336 | 12.49 |
| 44589.15625 | 11.5 |
| 44589.166666666664 | 11 |
| 44589.177083333336 | 12.68 |
| 44589.1875 | 11.15 |
| 44589.197916666664 | 10.26 |
| 44589.208333333336 | 10.45 |
| 44589.21875 | 9.82 |
| 44589.229166666664 | 9.13 |
| 44589.239583333336 | 9.3 |
| 44589.25 | 8.22 |
| 44589.260416666664 | 8.44 |
| 44589.270833333336 | 7.75 |
| 44589.28125 | 8.54 |
| 44589.291666666664 | 7.63 |
| 44589.302083333336 | 7.71 |
| 44589.3125 | 7.46 |
| 44589.322916666664 | 7.21 |
| 44589.333333333336 | 7.66 |
| 44589.34375 | 8.15 |
| 44589.354166666664 | 7.75 |
| 44589.364583333336 | 8.03 |
| 44589.375 | 7.39 |
| 44589.385416666664 | 8.26 |
| 44589.395833333336 | 7.93 |
| 44589.40625 | 8.48 |
| 44589.416666666664 | 9.53 |
| 44589.427083333336 | 9.95 |
| 44589.4375 | 7.49 |
| 44589.447916666664 | 9.4 |
| 44589.458333333336 | 7.67 |
| 44589.46875 | 7.98 |
| 44589.479166666664 | 8.3 |
| 44589.489583333336 | 7.6 |
| 44589.5 | 8.13 |
| 44589.510416666664 | 7.22 |
| 44589.520833333336 | 7.75 |
| 44589.53125 | 7.24 |
| 44589.541666666664 | 7.28 |
| 44589.552083333336 | 6.25 |
| 44589.5625 | 6.71 |
| 44589.572916666664 | 5.06 |
| 44589.583333333336 | 3.88 |
| 44589.59375 | 3.92 |
| 44589.604166666664 | 5.16 |
| 44589.614583333336 | 2.64 |
| 44589.625 | 2.54 |
| 44589.635416666664 | 2.07 |
| 44589.645833333336 | 2.05 |
| 44589.65625 | 1.8 |
| 44589.666666666664 | 3.2 |
| 44589.677083333336 | 5.31 |
| 44589.6875 | 3.35 |
| 44589.697916666664 | 4.07 |
| 44589.708333333336 | 5.57 |
| 44589.71875 | 7.02 |
| 44589.729166666664 | 7.78 |
| 44589.739583333336 | 6.19 |
| 44589.75 | 5.25 |
| 44589.760416666664 | 4.88 |
| 44589.770833333336 | 5.21 |
| 44589.78125 | 4.62 |
| 44589.791666666664 | 3.85 |
| 44589.802083333336 | 3.2 |
| 44589.8125 | 5.03 |
| 44589.822916666664 | 4.88 |
| 44589.833333333336 | 4.71 |
| 44589.84375 | 5.37 |
| 44589.854166666664 | 6.05 |
| 44589.864583333336 | 6.59 |
| 44589.875 | 6.78 |
| 44589.885416666664 | 7.11 |
| 44589.895833333336 | 6.27 |
| 44589.90625 | 6.74 |
| 44589.916666666664 | 7.58 |
| 44589.927083333336 | 7.37 |
| 44589.9375 | 7.2 |
| 44589.947916666664 | 7.74 |
| 44589.958333333336 | 7.56 |
| 44589.96875 | 7.43 |
| 44589.979166666664 | 7.41 |
| 44589.989583333336 | 7.6 |
| 44590.0 | 7.43 |
| 44590.010416666664 | 7.84 |
| 44590.020833333336 | 8.61 |
| 44590.03125 | 8.87 |
| 44590.041666666664 | 7.7 |
| 44590.052083333336 | 7.98 |
| 44590.0625 | 8.73 |
| 44590.072916666664 | 11.46 |
| 44590.083333333336 | 8.96 |
| 44590.09375 | 9.62 |
| 44590.104166666664 | 9.85 |
| 44590.114583333336 | 10.17 |
| 44590.125 | 10.01 |
| 44590.135416666664 | 10.66 |
| 44590.145833333336 | 11.2 |
| 44590.15625 | 10.34 |
| 44590.166666666664 | 13.65 |
| 44590.177083333336 | 11.23 |
| 44590.1875 | 11.31 |
| 44590.197916666664 | 11.99 |
| 44590.208333333336 | 12.74 |
| 44590.21875 | 12.16 |
| 44590.229166666664 | 11.18 |
| 44590.239583333336 | 10.29 |
| 44590.25 | 8.82 |
| 44590.260416666664 | 10.9 |
| 44590.270833333336 | 10.43 |
| 44590.28125 | 10.45 |
| 44590.291666666664 | 9.29 |
| 44590.302083333336 | 8.44 |
| 44590.3125 | 8.55 |
| 44590.322916666664 | 8.09 |
| 44590.333333333336 | 8.43 |
| 44590.34375 | 8.24 |
| 44590.354166666664 | 8.24 |
| 44590.364583333336 | 8.73 |
| 44590.375 | 8.76 |
| 44590.385416666664 | 8.42 |
| 44590.395833333336 | 8.55 |
| 44590.40625 | 9.59 |
| 44590.416666666664 | 9.08 |
| 44590.427083333336 | 9.39 |
| 44590.4375 | 9.4 |
| 44590.447916666664 | 8.79 |
| 44590.458333333336 | 9.34 |
| 44590.46875 | 7.85 |
| 44590.479166666664 | 9.59 |
| 44590.489583333336 | 9.69 |
| 44590.5 | 7.75 |
| 44590.510416666664 | 9.61 |
| 44590.520833333336 | 9.54 |
| 44590.53125 | 8.81 |
| 44590.541666666664 | 7.31 |
| 44590.552083333336 | 8.17 |
| 44590.5625 | 8.08 |
| 44590.572916666664 | 8.06 |
| 44590.583333333336 | 7.96 |
| 44590.59375 | 8.31 |
| 44590.604166666664 | 6.62 |
| 44590.614583333336 | 7.8 |
| 44590.625 | 7.35 |
| 44590.635416666664 | 6.43 |
| 44590.645833333336 | 145.2 |
| 44590.65625 | 7.41 |
| 44590.666666666664 | 6.62 |
| 44590.677083333336 | 6.58 |
| 44590.6875 | 3.77 |
| 44590.697916666664 | 4.07 |
| 44590.708333333336 | 3.25 |
| 44590.71875 | 2.34 |
| 44590.729166666664 | 2.8 |
| 44590.739583333336 | 3.79 |
| 44590.75 | 3.8 |
| 44590.760416666664 | 3.35 |
| 44590.770833333336 | 6.43 |
| 44590.78125 | 7.53 |
| 44590.791666666664 | 6.43 |
| 44590.802083333336 | 4.06 |
| 44590.8125 | 4.92 |
| 44590.822916666664 | 4.87 |
| 44590.833333333336 | 5.83 |
| 44590.84375 | 6.16 |
| 44590.854166666664 | 6.48 |
| 44590.864583333336 | 5.89 |
| 44590.875 | 7.04 |
| 44590.885416666664 | 6.46 |
| 44590.895833333336 | 9.06 |
| 44590.90625 | 9.14 |
| 44590.916666666664 | 9.47 |
| 44590.927083333336 | 9.18 |
| 44590.9375 | 8.87 |
| 44590.947916666664 | 10.25 |
| 44590.958333333336 | 10.61 |
| 44590.96875 | 10.39 |
| 44590.979166666664 | 11.45 |
| 44590.989583333336 | 10.4 |
| 44591.0 | 10.95 |
| 44591.010416666664 | 10.83 |
| 44591.020833333336 | 10.33 |
| 44591.03125 | 10.71 |
| 44591.041666666664 | 9.9 |
| 44591.052083333336 | 9.76 |
| 44591.0625 | 8.28 |
| 44591.072916666664 | 10.44 |
| 44591.083333333336 | 10.83 |
| 44591.09375 | 9.59 |
| 44591.104166666664 | 10.17 |
| 44591.114583333336 | 10.28 |
| 44591.125 | 12.94 |
| 44591.135416666664 | 11.51 |
| 44591.145833333336 | 11.36 |
| 44591.15625 | 11.31 |
| 44591.166666666664 | 11.85 |
| 44591.177083333336 | 11.58 |
| 44591.1875 | 11.92 |
| 44591.197916666664 | 11.15 |
| 44591.208333333336 | 11.77 |
| 44591.21875 | 15.33 |
| 44591.229166666664 | 13.09 |
| 44591.239583333336 | 13.2 |
| 44591.25 | 13.4 |
| 44591.260416666664 | 13.82 |
| 44591.270833333336 | 11.79 |
| 44591.28125 | 12.43 |
| 44591.291666666664 | 10.71 |
| 44591.302083333336 | 10.83 |
| 44591.3125 | 11.52 |
| 44591.322916666664 | 11.35 |
| 44591.333333333336 | 11.35 |
| 44591.34375 | 11.26 |
| 44591.354166666664 | 10.84 |
| 44591.364583333336 | 10.64 |
| 44591.375 | 11.25 |
| 44591.385416666664 | 10.53 |
| 44591.395833333336 | 10.64 |
| 44591.40625 | 10.06 |
| 44591.416666666664 | 9.57 |
| 44591.427083333336 | 10.44 |
| 44591.4375 | 9.64 |
| 44591.447916666664 | 9.4 |
| 44591.458333333336 | 11.37 |
| 44591.46875 | 10.69 |
| 44591.479166666664 | 11.2 |
| 44591.489583333336 | 11.76 |
| 44591.5 | 13.83 |
| 44591.510416666664 | 11.03 |
| 44591.520833333336 | 11.88 |
| 44591.53125 | 9.23 |
| 44591.541666666664 | 7.8 |
| 44591.552083333336 | 8.35 |
| 44591.5625 | 6.37 |
| 44591.572916666664 | 5.06 |
| 44591.583333333336 | 4.38 |
| 44591.59375 | 3.07 |
| 44591.604166666664 | 2.74 |
| 44591.614583333336 | 1.87 |
| 44591.625 | 2.21 |
| 44591.635416666664 | 2.38 |
| 44591.645833333336 | 2.85 |
| 44591.65625 | 2.72 |
| 44591.666666666664 | 2.66 |
| 44591.677083333336 | 3.06 |
| 44591.6875 | 3.26 |
| 44591.697916666664 | 3.84 |
| 44591.708333333336 | 3.86 |
| 44591.71875 | 2 |
| 44591.729166666664 | 2.38 |
| 44591.739583333336 | 1.79 |
| 44591.75 | 2.24 |
| 44591.760416666664 | 1.84 |
| 44591.770833333336 | 2.03 |
| 44591.78125 | 2.27 |
| 44591.791666666664 | 2.66 |
| 44591.802083333336 | 3.36 |
| 44591.8125 | 3.83 |
| 44591.822916666664 | 4.19 |
| 44591.833333333336 | 4.06 |
| 44591.84375 | 5.49 |
| 44591.854166666664 | 5.36 |
| 44591.864583333336 | 4.61 |
| 44591.875 | 5.74 |
| 44591.885416666664 | 6.35 |
| 44591.895833333336 | 6.11 |
| 44591.90625 | 6.55 |
| 44591.916666666664 | 6.94 |
| 44591.927083333336 | 7.25 |
| 44591.9375 | 7.23 |
| 44591.947916666664 | 7.61 |
| 44591.958333333336 | 7.27 |
| 44591.96875 | 7.47 |
| 44591.979166666664 | 7.88 |
| 44591.989583333336 | 8.63 |
| 44592.0 | 8 |
| 44592.010416666664 | 8.62 |
| 44592.020833333336 | 8.98 |
| 44592.03125 | 8.71 |
| 44592.041666666664 | 8.49 |
| 44592.052083333336 | 8.49 |
| 44592.0625 | 7.87 |
| 44592.072916666664 | 8.07 |
| 44592.083333333336 | 7.62 |
| 44592.09375 | 7.61 |
| 44592.104166666664 | 8.05 |
| 44592.114583333336 | 8.41 |
| 44592.125 | 8.6 |
| 44592.135416666664 | 9.09 |
| 44592.145833333336 | 8.24 |
| 44592.15625 | 8.77 |
| 44592.166666666664 | 8.86 |
| 44592.177083333336 | 9.04 |
| 44592.1875 | 8.41 |
| 44592.197916666664 | 8.7 |
| 44592.208333333336 | 9.4 |
| 44592.21875 | 9.1 |
| 44592.229166666664 | 9.61 |
| 44592.239583333336 | 11.5 |
| 44592.25 | 10.38 |
| 44592.260416666664 | 10.99 |
| 44592.270833333336 | 9.35 |
| 44592.28125 | 9.67 |
| 44592.291666666664 | 11.4 |
| 44592.302083333336 | 9.81 |
| 44592.3125 | 9.74 |
| 44592.322916666664 | 9.18 |
| 44592.333333333336 | 9.56 |
| 44592.34375 | 9.85 |
| 44592.354166666664 | 9.29 |
| 44592.364583333336 | 9.03 |
| 44592.375 | 9.03 |
| 44592.385416666664 | 8.9 |
| 44592.395833333336 | 8.55 |
| 44592.40625 | 8.79 |
| 44592.416666666664 | 8.7 |
| 44592.427083333336 | 8.59 |
| 44592.4375 | 8.73 |
| 44592.447916666664 | 8.43 |
| 44592.458333333336 | 8.57 |
| 44592.46875 | 8.5 |
| 44592.479166666664 | 8.3 |
| 44592.489583333336 | 7.56 |
| 44592.5 | 9.13 |
| 44592.510416666664 | 8.63 |
| 44592.520833333336 | 8.4 |
| 44592.53125 | 8.26 |
| 44592.541666666664 | 8.42 |
| 44592.552083333336 | 8.07 |
| 44592.5625 | 5.16 |
| 44592.572916666664 | 4.14 |
| 44592.583333333336 | 4.37 |
| 44592.59375 | 2.47 |
| 44592.604166666664 | 2.77 |
| 44592.614583333336 | 2.55 |
| 44592.625 | 1.78 |
| 44592.635416666664 | 1.64 |
| 44592.645833333336 | 1.51 |
| 44592.65625 | 1.66 |
| 44592.666666666664 | 1.55 |
| 44592.677083333336 | 1.54 |
| 44592.6875 | 1.62 |
| 44592.697916666664 | 1.84 |
| 44592.708333333336 | 1.91 |
| 44592.71875 | 2.79 |
| 44592.729166666664 | 2.23 |
| 44592.739583333336 | 3.11 |
| 44592.75 | 2.91 |
| 44592.760416666664 | 2.72 |
| 44592.770833333336 | 3.04 |
| 44592.78125 | 4.18 |
| 44592.791666666664 | 5.7 |
| 44592.802083333336 | 3.98 |
| 44592.8125 | 6.73 |
| 44592.822916666664 | 6.56 |
| 44592.833333333336 | 5.3 |
| 44592.84375 | 6.19 |
| 44592.854166666664 | 6.05 |
| 44592.864583333336 | 6.61 |
| 44592.875 | 7.11 |
| 44592.885416666664 | 6.3 |
| 44592.895833333336 | 7.59 |
| 44592.90625 | 8.43 |
| 44592.916666666664 | 9.49 |
| 44592.927083333336 | 12.07 |
| 44592.9375 | 9.12 |
| 44592.947916666664 | 10.26 |
| 44592.958333333336 | 11.15 |
| 44592.96875 | 10.06 |
| 44592.979166666664 | 8.92 |
| 44592.989583333336 | 9.91 |
| 44593.0 | 10.59 |
| 44593.010416666664 | 11.31 |
| 44593.020833333336 | 10.57 |
| 44593.03125 | 9.95 |
| 44593.041666666664 | 9.61 |
| 44593.052083333336 | 10.07 |
| 44593.0625 | 8.42 |
| 44593.072916666664 | 10.06 |
| 44593.083333333336 | 9.06 |
| 44593.09375 | 9.45 |
| 44593.104166666664 | 9.46 |
| 44593.114583333336 | 9.74 |
| 44593.125 | 9.32 |
| 44593.135416666664 | 9.72 |
| 44593.145833333336 | 9.55 |
| 44593.15625 | 10.53 |